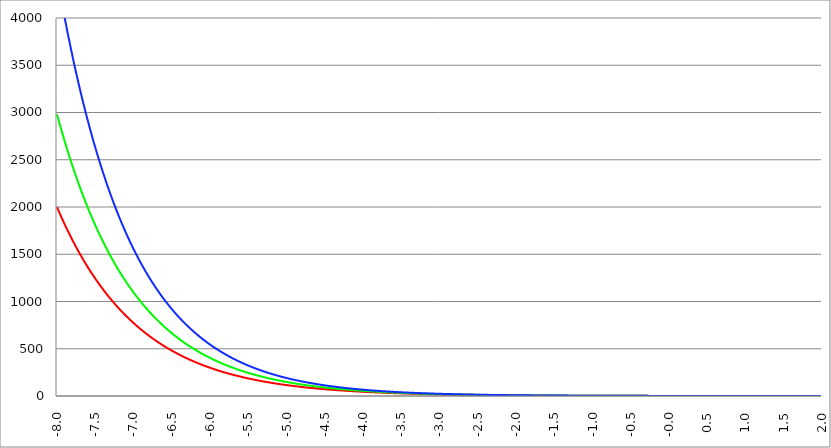
| Category | Series 1 | Series 0 | Series 2 |
|---|---|---|---|
| -8.0 | 1998.196 | 2980.958 | 4447.067 |
| -7.995 | 1988.727 | 2966.09 | 4423.781 |
| -7.99 | 1979.303 | 2951.297 | 4400.617 |
| -7.985 | 1969.924 | 2936.577 | 4377.574 |
| -7.98 | 1960.589 | 2921.931 | 4354.652 |
| -7.975 | 1951.298 | 2907.358 | 4331.85 |
| -7.97 | 1942.051 | 2892.857 | 4309.167 |
| -7.965000000000001 | 1932.848 | 2878.429 | 4286.604 |
| -7.960000000000001 | 1923.689 | 2864.073 | 4264.158 |
| -7.955000000000001 | 1914.573 | 2849.788 | 4241.83 |
| -7.950000000000001 | 1905.501 | 2835.575 | 4219.618 |
| -7.945000000000001 | 1896.471 | 2821.432 | 4197.524 |
| -7.940000000000001 | 1887.484 | 2807.361 | 4175.544 |
| -7.935000000000001 | 1878.54 | 2793.359 | 4153.68 |
| -7.930000000000001 | 1869.638 | 2779.427 | 4131.93 |
| -7.925000000000002 | 1860.778 | 2765.564 | 4110.295 |
| -7.920000000000002 | 1851.96 | 2751.771 | 4088.772 |
| -7.915000000000002 | 1843.184 | 2738.047 | 4067.362 |
| -7.910000000000002 | 1834.45 | 2724.39 | 4046.065 |
| -7.905000000000002 | 1825.757 | 2710.803 | 4024.878 |
| -7.900000000000002 | 1817.105 | 2697.282 | 4003.803 |
| -7.895000000000002 | 1808.494 | 2683.83 | 3982.838 |
| -7.890000000000002 | 1799.925 | 2670.444 | 3961.983 |
| -7.885000000000002 | 1791.395 | 2657.125 | 3941.237 |
| -7.880000000000002 | 1782.906 | 2643.873 | 3920.6 |
| -7.875000000000003 | 1774.457 | 2630.686 | 3900.071 |
| -7.870000000000003 | 1766.049 | 2617.566 | 3879.649 |
| -7.865000000000003 | 1757.68 | 2604.51 | 3859.334 |
| -7.860000000000003 | 1749.351 | 2591.52 | 3839.126 |
| -7.855000000000003 | 1741.061 | 2578.595 | 3819.023 |
| -7.850000000000003 | 1732.811 | 2565.734 | 3799.026 |
| -7.845000000000003 | 1724.599 | 2552.938 | 3779.133 |
| -7.840000000000003 | 1716.427 | 2540.205 | 3759.345 |
| -7.835000000000003 | 1708.293 | 2527.536 | 3739.66 |
| -7.830000000000004 | 1700.198 | 2514.929 | 3720.078 |
| -7.825000000000004 | 1692.141 | 2502.386 | 3700.599 |
| -7.820000000000004 | 1684.123 | 2489.905 | 3681.222 |
| -7.815000000000004 | 1676.142 | 2477.487 | 3661.946 |
| -7.810000000000004 | 1668.199 | 2465.13 | 3642.771 |
| -7.805000000000004 | 1660.294 | 2452.836 | 3623.697 |
| -7.800000000000004 | 1652.426 | 2440.602 | 3604.722 |
| -7.795000000000004 | 1644.596 | 2428.429 | 3585.847 |
| -7.790000000000004 | 1636.803 | 2416.318 | 3567.071 |
| -7.785000000000004 | 1629.046 | 2404.266 | 3548.393 |
| -7.780000000000004 | 1621.327 | 2392.275 | 3529.812 |
| -7.775000000000004 | 1613.644 | 2380.343 | 3511.329 |
| -7.770000000000004 | 1605.997 | 2368.471 | 3492.943 |
| -7.765000000000005 | 1598.387 | 2356.658 | 3474.653 |
| -7.760000000000005 | 1590.812 | 2344.905 | 3456.459 |
| -7.755000000000005 | 1583.274 | 2333.209 | 3438.36 |
| -7.750000000000005 | 1575.771 | 2321.572 | 3420.356 |
| -7.745000000000005 | 1568.304 | 2309.994 | 3402.446 |
| -7.740000000000005 | 1560.872 | 2298.472 | 3384.63 |
| -7.735000000000005 | 1553.476 | 2287.009 | 3366.908 |
| -7.730000000000005 | 1546.114 | 2275.602 | 3349.278 |
| -7.725000000000006 | 1538.787 | 2264.253 | 3331.74 |
| -7.720000000000006 | 1531.496 | 2252.96 | 3314.294 |
| -7.715000000000006 | 1524.238 | 2241.723 | 3296.94 |
| -7.710000000000006 | 1517.015 | 2230.542 | 3279.676 |
| -7.705000000000006 | 1509.826 | 2219.417 | 3262.503 |
| -7.700000000000006 | 1502.672 | 2208.348 | 3245.42 |
| -7.695000000000006 | 1495.551 | 2197.334 | 3228.426 |
| -7.690000000000006 | 1488.464 | 2186.375 | 3211.521 |
| -7.685000000000007 | 1481.411 | 2175.47 | 3194.705 |
| -7.680000000000007 | 1474.391 | 2164.62 | 3177.977 |
| -7.675000000000007 | 1467.404 | 2153.824 | 3161.336 |
| -7.670000000000007 | 1460.45 | 2143.081 | 3144.782 |
| -7.665000000000007 | 1453.529 | 2132.393 | 3128.316 |
| -7.660000000000007 | 1446.642 | 2121.757 | 3111.935 |
| -7.655000000000007 | 1439.786 | 2111.175 | 3095.64 |
| -7.650000000000007 | 1432.964 | 2100.646 | 3079.431 |
| -7.645000000000007 | 1426.173 | 2090.169 | 3063.306 |
| -7.640000000000008 | 1419.415 | 2079.744 | 3047.266 |
| -7.635000000000008 | 1412.689 | 2069.371 | 3031.31 |
| -7.630000000000008 | 1405.994 | 2059.05 | 3015.437 |
| -7.625000000000008 | 1399.332 | 2048.78 | 2999.647 |
| -7.620000000000008 | 1392.701 | 2038.562 | 2983.94 |
| -7.615000000000008 | 1386.101 | 2028.395 | 2968.316 |
| -7.610000000000008 | 1379.533 | 2018.278 | 2952.773 |
| -7.605000000000008 | 1372.995 | 2008.212 | 2937.312 |
| -7.600000000000008 | 1366.489 | 1998.196 | 2921.931 |
| -7.595000000000009 | 1360.014 | 1988.23 | 2906.631 |
| -7.590000000000009 | 1353.569 | 1978.314 | 2891.411 |
| -7.585000000000009 | 1347.155 | 1968.447 | 2876.271 |
| -7.580000000000009 | 1340.771 | 1958.629 | 2861.21 |
| -7.57500000000001 | 1334.417 | 1948.86 | 2846.228 |
| -7.57000000000001 | 1328.094 | 1939.14 | 2831.325 |
| -7.565000000000009 | 1321.8 | 1929.469 | 2816.499 |
| -7.560000000000009 | 1315.537 | 1919.846 | 2801.751 |
| -7.555000000000009 | 1309.303 | 1910.27 | 2787.081 |
| -7.55000000000001 | 1303.098 | 1900.743 | 2772.487 |
| -7.54500000000001 | 1296.923 | 1891.263 | 2757.97 |
| -7.54000000000001 | 1290.777 | 1881.83 | 2743.528 |
| -7.53500000000001 | 1284.661 | 1872.444 | 2729.162 |
| -7.53000000000001 | 1278.573 | 1863.106 | 2714.872 |
| -7.52500000000001 | 1272.514 | 1853.813 | 2700.656 |
| -7.52000000000001 | 1266.484 | 1844.567 | 2686.515 |
| -7.51500000000001 | 1260.483 | 1835.367 | 2672.448 |
| -7.51000000000001 | 1254.51 | 1826.214 | 2658.454 |
| -7.505000000000011 | 1248.565 | 1817.105 | 2644.534 |
| -7.500000000000011 | 1242.648 | 1808.042 | 2630.686 |
| -7.495000000000011 | 1236.76 | 1799.025 | 2616.911 |
| -7.490000000000011 | 1230.899 | 1790.052 | 2603.208 |
| -7.485000000000011 | 1225.066 | 1781.124 | 2589.577 |
| -7.480000000000011 | 1219.261 | 1772.241 | 2576.018 |
| -7.475000000000011 | 1213.483 | 1763.402 | 2562.529 |
| -7.470000000000011 | 1207.733 | 1754.607 | 2549.111 |
| -7.465000000000011 | 1202.009 | 1745.856 | 2535.763 |
| -7.460000000000011 | 1196.313 | 1737.148 | 2522.485 |
| -7.455000000000012 | 1190.644 | 1728.484 | 2509.277 |
| -7.450000000000012 | 1185.002 | 1719.863 | 2496.138 |
| -7.445000000000012 | 1179.387 | 1711.285 | 2483.068 |
| -7.440000000000012 | 1173.798 | 1702.75 | 2470.066 |
| -7.435000000000012 | 1168.236 | 1694.258 | 2457.132 |
| -7.430000000000012 | 1162.7 | 1685.808 | 2444.266 |
| -7.425000000000012 | 1157.19 | 1677.4 | 2431.467 |
| -7.420000000000012 | 1151.706 | 1669.034 | 2418.735 |
| -7.415000000000012 | 1146.249 | 1660.709 | 2406.07 |
| -7.410000000000013 | 1140.817 | 1652.426 | 2393.471 |
| -7.405000000000013 | 1135.411 | 1644.185 | 2380.938 |
| -7.400000000000013 | 1130.031 | 1635.984 | 2368.471 |
| -7.395000000000013 | 1124.676 | 1627.825 | 2356.069 |
| -7.390000000000013 | 1119.346 | 1619.706 | 2343.732 |
| -7.385000000000013 | 1114.042 | 1611.628 | 2331.46 |
| -7.380000000000013 | 1108.763 | 1603.59 | 2319.252 |
| -7.375000000000013 | 1103.509 | 1595.592 | 2307.108 |
| -7.370000000000013 | 1098.279 | 1587.634 | 2295.027 |
| -7.365000000000013 | 1093.075 | 1579.715 | 2283.01 |
| -7.360000000000014 | 1087.895 | 1571.837 | 2271.056 |
| -7.355000000000014 | 1082.74 | 1563.997 | 2259.164 |
| -7.350000000000014 | 1077.609 | 1556.197 | 2247.334 |
| -7.345000000000014 | 1072.503 | 1548.435 | 2235.567 |
| -7.340000000000014 | 1067.42 | 1540.712 | 2223.861 |
| -7.335000000000014 | 1062.362 | 1533.028 | 2212.216 |
| -7.330000000000014 | 1057.328 | 1525.382 | 2200.632 |
| -7.325000000000014 | 1052.317 | 1517.774 | 2189.109 |
| -7.320000000000014 | 1047.331 | 1510.204 | 2177.647 |
| -7.315000000000015 | 1042.368 | 1502.672 | 2166.244 |
| -7.310000000000015 | 1037.428 | 1495.177 | 2154.901 |
| -7.305000000000015 | 1032.512 | 1487.72 | 2143.617 |
| -7.300000000000015 | 1027.619 | 1480.3 | 2132.393 |
| -7.295000000000015 | 1022.75 | 1472.917 | 2121.227 |
| -7.290000000000015 | 1017.903 | 1465.571 | 2110.12 |
| -7.285000000000015 | 1013.08 | 1458.261 | 2099.071 |
| -7.280000000000015 | 1008.279 | 1450.988 | 2088.079 |
| -7.275000000000015 | 1003.501 | 1443.751 | 2077.146 |
| -7.270000000000015 | 998.746 | 1436.55 | 2066.269 |
| -7.265000000000016 | 994.013 | 1429.386 | 2055.45 |
| -7.260000000000016 | 989.302 | 1422.257 | 2044.687 |
| -7.255000000000016 | 984.614 | 1415.163 | 2033.981 |
| -7.250000000000016 | 979.948 | 1408.105 | 2023.33 |
| -7.245000000000016 | 975.305 | 1401.082 | 2012.735 |
| -7.240000000000016 | 970.683 | 1394.094 | 2002.196 |
| -7.235000000000016 | 966.083 | 1387.141 | 1991.712 |
| -7.230000000000016 | 961.505 | 1380.223 | 1981.283 |
| -7.225000000000017 | 956.949 | 1373.339 | 1970.909 |
| -7.220000000000017 | 952.414 | 1366.489 | 1960.589 |
| -7.215000000000017 | 947.901 | 1359.674 | 1950.322 |
| -7.210000000000017 | 943.409 | 1352.892 | 1940.11 |
| -7.205000000000017 | 938.939 | 1346.145 | 1929.951 |
| -7.200000000000017 | 934.489 | 1339.431 | 1919.846 |
| -7.195000000000017 | 930.061 | 1332.75 | 1909.793 |
| -7.190000000000017 | 925.654 | 1326.103 | 1899.793 |
| -7.185000000000017 | 921.267 | 1319.489 | 1889.845 |
| -7.180000000000017 | 916.901 | 1312.908 | 1879.949 |
| -7.175000000000018 | 912.556 | 1306.36 | 1870.105 |
| -7.170000000000018 | 908.232 | 1299.845 | 1860.313 |
| -7.165000000000018 | 903.928 | 1293.362 | 1850.572 |
| -7.160000000000018 | 899.645 | 1286.911 | 1840.882 |
| -7.155000000000018 | 895.382 | 1280.492 | 1831.243 |
| -7.150000000000018 | 891.139 | 1274.106 | 1821.654 |
| -7.145000000000018 | 886.916 | 1267.751 | 1812.115 |
| -7.140000000000018 | 882.713 | 1261.428 | 1802.626 |
| -7.135000000000018 | 878.53 | 1255.137 | 1793.187 |
| -7.130000000000019 | 874.367 | 1248.877 | 1783.798 |
| -7.125000000000019 | 870.223 | 1242.648 | 1774.457 |
| -7.120000000000019 | 866.1 | 1236.45 | 1765.166 |
| -7.115000000000019 | 861.995 | 1230.284 | 1755.923 |
| -7.110000000000019 | 857.911 | 1224.148 | 1746.729 |
| -7.105000000000019 | 853.845 | 1218.042 | 1737.582 |
| -7.100000000000019 | 849.799 | 1211.967 | 1728.484 |
| -7.095000000000019 | 845.772 | 1205.922 | 1719.433 |
| -7.090000000000019 | 841.764 | 1199.908 | 1710.43 |
| -7.085000000000019 | 837.775 | 1193.923 | 1701.474 |
| -7.08000000000002 | 833.805 | 1187.969 | 1692.564 |
| -7.07500000000002 | 829.854 | 1182.044 | 1683.702 |
| -7.07000000000002 | 825.922 | 1176.148 | 1674.885 |
| -7.06500000000002 | 822.008 | 1170.282 | 1666.115 |
| -7.06000000000002 | 818.113 | 1164.445 | 1657.391 |
| -7.05500000000002 | 814.236 | 1158.637 | 1648.713 |
| -7.05000000000002 | 810.377 | 1152.859 | 1640.08 |
| -7.04500000000002 | 806.537 | 1147.109 | 1631.492 |
| -7.04000000000002 | 802.715 | 1141.388 | 1622.949 |
| -7.03500000000002 | 798.911 | 1135.695 | 1614.451 |
| -7.03000000000002 | 795.126 | 1130.031 | 1605.997 |
| -7.025000000000021 | 791.358 | 1124.395 | 1597.588 |
| -7.020000000000021 | 787.608 | 1118.787 | 1589.222 |
| -7.015000000000021 | 783.875 | 1113.207 | 1580.901 |
| -7.010000000000021 | 780.161 | 1107.655 | 1572.623 |
| -7.005000000000021 | 776.464 | 1102.13 | 1564.388 |
| -7.000000000000021 | 772.784 | 1096.633 | 1556.197 |
| -6.995000000000021 | 769.122 | 1091.164 | 1548.048 |
| -6.990000000000021 | 765.478 | 1085.721 | 1539.942 |
| -6.985000000000021 | 761.85 | 1080.306 | 1531.878 |
| -6.980000000000021 | 758.24 | 1074.918 | 1523.857 |
| -6.975000000000021 | 754.647 | 1069.557 | 1515.878 |
| -6.970000000000021 | 751.071 | 1064.223 | 1507.94 |
| -6.965000000000022 | 747.512 | 1058.915 | 1500.044 |
| -6.960000000000022 | 743.969 | 1053.634 | 1492.19 |
| -6.955000000000022 | 740.444 | 1048.379 | 1484.376 |
| -6.950000000000022 | 736.935 | 1043.15 | 1476.604 |
| -6.945000000000022 | 733.443 | 1037.947 | 1468.872 |
| -6.940000000000022 | 729.967 | 1032.77 | 1461.181 |
| -6.935000000000022 | 726.508 | 1027.619 | 1453.529 |
| -6.930000000000022 | 723.066 | 1022.494 | 1445.918 |
| -6.925000000000023 | 719.639 | 1017.394 | 1438.347 |
| -6.920000000000023 | 716.229 | 1012.32 | 1430.816 |
| -6.915000000000023 | 712.835 | 1007.271 | 1423.324 |
| -6.910000000000023 | 709.457 | 1002.247 | 1415.871 |
| -6.905000000000023 | 706.095 | 997.249 | 1408.457 |
| -6.900000000000023 | 702.749 | 992.275 | 1401.082 |
| -6.895000000000023 | 699.419 | 987.326 | 1393.745 |
| -6.890000000000024 | 696.105 | 982.401 | 1386.448 |
| -6.885000000000024 | 692.806 | 977.502 | 1379.188 |
| -6.880000000000024 | 689.523 | 972.626 | 1371.966 |
| -6.875000000000024 | 686.255 | 967.775 | 1364.782 |
| -6.870000000000024 | 683.004 | 962.949 | 1357.636 |
| -6.865000000000024 | 679.767 | 958.146 | 1350.527 |
| -6.860000000000024 | 676.546 | 953.367 | 1343.455 |
| -6.855000000000024 | 673.34 | 948.612 | 1336.42 |
| -6.850000000000024 | 670.149 | 943.881 | 1329.423 |
| -6.845000000000024 | 666.973 | 939.173 | 1322.461 |
| -6.840000000000024 | 663.813 | 934.489 | 1315.537 |
| -6.835000000000024 | 660.667 | 929.828 | 1308.648 |
| -6.830000000000024 | 657.536 | 925.191 | 1301.796 |
| -6.825000000000025 | 654.42 | 920.576 | 1294.979 |
| -6.820000000000025 | 651.319 | 915.985 | 1288.198 |
| -6.815000000000025 | 648.233 | 911.417 | 1281.453 |
| -6.810000000000025 | 645.161 | 906.871 | 1274.743 |
| -6.805000000000025 | 642.104 | 902.348 | 1268.068 |
| -6.800000000000025 | 639.061 | 897.847 | 1261.428 |
| -6.795000000000025 | 636.033 | 893.369 | 1254.823 |
| -6.790000000000025 | 633.019 | 888.914 | 1248.253 |
| -6.785000000000025 | 630.019 | 884.48 | 1241.717 |
| -6.780000000000025 | 627.034 | 880.069 | 1235.215 |
| -6.775000000000026 | 624.062 | 875.679 | 1228.747 |
| -6.770000000000026 | 621.105 | 871.312 | 1222.313 |
| -6.765000000000026 | 618.162 | 866.966 | 1215.912 |
| -6.760000000000026 | 615.232 | 862.642 | 1209.546 |
| -6.755000000000026 | 612.317 | 858.34 | 1203.212 |
| -6.750000000000026 | 609.415 | 854.059 | 1196.912 |
| -6.745000000000026 | 606.527 | 849.799 | 1190.644 |
| -6.740000000000026 | 603.653 | 845.561 | 1184.41 |
| -6.735000000000026 | 600.793 | 841.343 | 1178.208 |
| -6.730000000000026 | 597.946 | 837.147 | 1172.039 |
| -6.725000000000027 | 595.112 | 832.972 | 1165.902 |
| -6.720000000000027 | 592.292 | 828.818 | 1159.797 |
| -6.715000000000027 | 589.485 | 824.684 | 1153.724 |
| -6.710000000000027 | 586.692 | 820.571 | 1147.683 |
| -6.705000000000027 | 583.912 | 816.478 | 1141.673 |
| -6.700000000000027 | 581.145 | 812.406 | 1135.695 |
| -6.695000000000028 | 578.391 | 808.354 | 1129.748 |
| -6.690000000000028 | 575.65 | 804.322 | 1123.833 |
| -6.685000000000028 | 572.922 | 800.311 | 1117.948 |
| -6.680000000000028 | 570.207 | 796.319 | 1112.094 |
| -6.675000000000028 | 567.505 | 792.347 | 1106.271 |
| -6.670000000000028 | 564.816 | 788.396 | 1100.478 |
| -6.665000000000028 | 562.139 | 784.463 | 1094.716 |
| -6.660000000000028 | 559.476 | 780.551 | 1088.984 |
| -6.655000000000029 | 556.824 | 776.658 | 1083.281 |
| -6.650000000000029 | 554.186 | 772.784 | 1077.609 |
| -6.645000000000029 | 551.56 | 768.93 | 1071.966 |
| -6.640000000000029 | 548.946 | 765.095 | 1066.353 |
| -6.63500000000003 | 546.345 | 761.279 | 1060.77 |
| -6.63000000000003 | 543.756 | 757.482 | 1055.215 |
| -6.625000000000029 | 541.179 | 753.704 | 1049.69 |
| -6.620000000000029 | 538.614 | 749.945 | 1044.193 |
| -6.615000000000029 | 536.062 | 746.205 | 1038.726 |
| -6.61000000000003 | 533.522 | 742.483 | 1033.287 |
| -6.60500000000003 | 530.994 | 738.78 | 1027.876 |
| -6.60000000000003 | 528.477 | 735.095 | 1022.494 |
| -6.59500000000003 | 525.973 | 731.429 | 1017.14 |
| -6.59000000000003 | 523.481 | 727.781 | 1011.814 |
| -6.58500000000003 | 521 | 724.151 | 1006.516 |
| -6.58000000000003 | 518.531 | 720.539 | 1001.245 |
| -6.57500000000003 | 516.074 | 716.946 | 996.003 |
| -6.57000000000003 | 513.628 | 713.37 | 990.787 |
| -6.565000000000031 | 511.194 | 709.812 | 985.599 |
| -6.560000000000031 | 508.772 | 706.272 | 980.439 |
| -6.555000000000031 | 506.361 | 702.749 | 975.305 |
| -6.550000000000031 | 503.962 | 699.244 | 970.198 |
| -6.545000000000031 | 501.573 | 695.757 | 965.118 |
| -6.540000000000031 | 499.197 | 692.287 | 960.064 |
| -6.535000000000031 | 496.831 | 688.834 | 955.037 |
| -6.530000000000031 | 494.477 | 685.398 | 950.036 |
| -6.525000000000031 | 492.133 | 681.98 | 945.061 |
| -6.520000000000032 | 489.801 | 678.578 | 940.113 |
| -6.515000000000032 | 487.48 | 675.194 | 935.19 |
| -6.510000000000032 | 485.17 | 671.826 | 930.293 |
| -6.505000000000032 | 482.871 | 668.476 | 925.422 |
| -6.500000000000032 | 480.583 | 665.142 | 920.576 |
| -6.495000000000032 | 478.306 | 661.824 | 915.756 |
| -6.490000000000032 | 476.039 | 658.523 | 910.961 |
| -6.485000000000032 | 473.783 | 655.239 | 906.191 |
| -6.480000000000032 | 471.538 | 651.971 | 901.446 |
| -6.475000000000032 | 469.304 | 648.719 | 896.726 |
| -6.470000000000032 | 467.08 | 645.484 | 892.03 |
| -6.465000000000033 | 464.866 | 642.264 | 887.359 |
| -6.460000000000033 | 462.663 | 639.061 | 882.713 |
| -6.455000000000033 | 460.471 | 635.874 | 878.091 |
| -6.450000000000033 | 458.289 | 632.702 | 873.493 |
| -6.445000000000033 | 456.117 | 629.547 | 868.919 |
| -6.440000000000033 | 453.956 | 626.407 | 864.369 |
| -6.435000000000033 | 451.805 | 623.283 | 859.843 |
| -6.430000000000033 | 449.664 | 620.174 | 855.341 |
| -6.425000000000034 | 447.533 | 617.081 | 850.862 |
| -6.420000000000034 | 445.412 | 614.003 | 846.407 |
| -6.415000000000034 | 443.301 | 610.941 | 841.975 |
| -6.410000000000034 | 441.201 | 607.894 | 837.566 |
| -6.405000000000034 | 439.11 | 604.862 | 833.18 |
| -6.400000000000034 | 437.029 | 601.845 | 828.818 |
| -6.395000000000034 | 434.958 | 598.843 | 824.478 |
| -6.390000000000034 | 432.897 | 595.857 | 820.16 |
| -6.385000000000034 | 430.846 | 592.885 | 815.866 |
| -6.380000000000034 | 428.804 | 589.928 | 811.594 |
| -6.375000000000034 | 426.772 | 586.985 | 807.344 |
| -6.370000000000034 | 424.75 | 584.058 | 803.117 |
| -6.365000000000035 | 422.737 | 581.145 | 798.911 |
| -6.360000000000035 | 420.734 | 578.246 | 794.728 |
| -6.355000000000035 | 418.74 | 575.362 | 790.567 |
| -6.350000000000035 | 416.756 | 572.493 | 786.427 |
| -6.345000000000035 | 414.781 | 569.637 | 782.309 |
| -6.340000000000035 | 412.815 | 566.796 | 778.213 |
| -6.335000000000035 | 410.859 | 563.969 | 774.138 |
| -6.330000000000035 | 408.912 | 561.157 | 770.084 |
| -6.325000000000036 | 406.974 | 558.358 | 766.052 |
| -6.320000000000036 | 405.046 | 555.573 | 762.041 |
| -6.315000000000036 | 403.126 | 552.802 | 758.05 |
| -6.310000000000036 | 401.216 | 550.045 | 754.081 |
| -6.305000000000036 | 399.315 | 547.302 | 750.133 |
| -6.300000000000036 | 397.423 | 544.572 | 746.205 |
| -6.295000000000036 | 395.539 | 541.856 | 742.297 |
| -6.290000000000036 | 393.665 | 539.153 | 738.411 |
| -6.285000000000036 | 391.799 | 536.464 | 734.544 |
| -6.280000000000036 | 389.943 | 533.789 | 730.698 |
| -6.275000000000036 | 388.095 | 531.126 | 726.872 |
| -6.270000000000036 | 386.256 | 528.477 | 723.066 |
| -6.265000000000037 | 384.425 | 525.842 | 719.279 |
| -6.260000000000037 | 382.604 | 523.219 | 715.513 |
| -6.255000000000037 | 380.791 | 520.609 | 711.767 |
| -6.250000000000037 | 378.986 | 518.013 | 708.04 |
| -6.245000000000037 | 377.19 | 515.429 | 704.332 |
| -6.240000000000037 | 375.403 | 512.859 | 700.644 |
| -6.235000000000037 | 373.624 | 510.301 | 696.975 |
| -6.230000000000037 | 371.854 | 507.755 | 693.326 |
| -6.225000000000038 | 370.091 | 505.223 | 689.695 |
| -6.220000000000038 | 368.338 | 502.703 | 686.084 |
| -6.215000000000038 | 366.592 | 500.196 | 682.491 |
| -6.210000000000038 | 364.855 | 497.701 | 678.918 |
| -6.205000000000038 | 363.126 | 495.219 | 675.363 |
| -6.200000000000038 | 361.405 | 492.749 | 671.826 |
| -6.195000000000038 | 359.693 | 490.291 | 668.309 |
| -6.190000000000039 | 357.988 | 487.846 | 664.809 |
| -6.185000000000039 | 356.292 | 485.413 | 661.328 |
| -6.180000000000039 | 354.603 | 482.992 | 657.865 |
| -6.175000000000039 | 352.923 | 480.583 | 654.42 |
| -6.170000000000039 | 351.251 | 478.186 | 650.994 |
| -6.165000000000039 | 349.586 | 475.801 | 647.585 |
| -6.160000000000039 | 347.93 | 473.428 | 644.194 |
| -6.155000000000039 | 346.281 | 471.067 | 640.821 |
| -6.150000000000039 | 344.64 | 468.717 | 637.465 |
| -6.14500000000004 | 343.007 | 466.38 | 634.127 |
| -6.14000000000004 | 341.381 | 464.054 | 630.807 |
| -6.13500000000004 | 339.764 | 461.739 | 627.504 |
| -6.13000000000004 | 338.154 | 459.436 | 624.218 |
| -6.12500000000004 | 336.551 | 457.145 | 620.95 |
| -6.12000000000004 | 334.956 | 454.865 | 617.698 |
| -6.11500000000004 | 333.369 | 452.596 | 614.464 |
| -6.11000000000004 | 331.789 | 450.339 | 611.246 |
| -6.10500000000004 | 330.217 | 448.093 | 608.046 |
| -6.10000000000004 | 328.652 | 445.858 | 604.862 |
| -6.095000000000041 | 327.095 | 443.634 | 601.695 |
| -6.090000000000041 | 325.545 | 441.421 | 598.544 |
| -6.085000000000041 | 324.002 | 439.22 | 595.41 |
| -6.080000000000041 | 322.467 | 437.029 | 592.292 |
| -6.075000000000041 | 320.939 | 434.85 | 589.191 |
| -6.070000000000041 | 319.418 | 432.681 | 586.106 |
| -6.065000000000041 | 317.904 | 430.523 | 583.037 |
| -6.060000000000041 | 316.398 | 428.375 | 579.984 |
| -6.055000000000041 | 314.898 | 426.239 | 576.947 |
| -6.050000000000042 | 313.406 | 424.113 | 573.926 |
| -6.045000000000042 | 311.921 | 421.998 | 570.921 |
| -6.040000000000042 | 310.443 | 419.893 | 567.931 |
| -6.035000000000042 | 308.972 | 417.799 | 564.957 |
| -6.030000000000042 | 307.508 | 415.715 | 561.999 |
| -6.025000000000042 | 306.05 | 413.642 | 559.056 |
| -6.020000000000042 | 304.6 | 411.579 | 556.129 |
| -6.015000000000042 | 303.157 | 409.526 | 553.217 |
| -6.010000000000042 | 301.72 | 407.483 | 550.32 |
| -6.005000000000043 | 300.29 | 405.451 | 547.438 |
| -6.000000000000043 | 298.867 | 403.429 | 544.572 |
| -5.995000000000043 | 297.451 | 401.417 | 541.72 |
| -5.990000000000043 | 296.042 | 399.415 | 538.884 |
| -5.985000000000043 | 294.639 | 397.423 | 536.062 |
| -5.980000000000043 | 293.243 | 395.44 | 533.255 |
| -5.975000000000043 | 291.853 | 393.468 | 530.463 |
| -5.970000000000043 | 290.47 | 391.506 | 527.685 |
| -5.965000000000043 | 289.093 | 389.553 | 524.922 |
| -5.960000000000043 | 287.724 | 387.61 | 522.174 |
| -5.955000000000044 | 286.36 | 385.677 | 519.439 |
| -5.950000000000044 | 285.003 | 383.753 | 516.719 |
| -5.945000000000044 | 283.653 | 381.839 | 514.014 |
| -5.940000000000044 | 282.308 | 379.935 | 511.322 |
| -5.935000000000044 | 280.971 | 378.04 | 508.645 |
| -5.930000000000044 | 279.639 | 376.155 | 505.981 |
| -5.925000000000044 | 278.314 | 374.278 | 503.332 |
| -5.920000000000044 | 276.995 | 372.412 | 500.696 |
| -5.915000000000044 | 275.683 | 370.554 | 498.075 |
| -5.910000000000044 | 274.376 | 368.706 | 495.467 |
| -5.905000000000044 | 273.076 | 366.867 | 492.872 |
| -5.900000000000044 | 271.782 | 365.037 | 490.291 |
| -5.895000000000045 | 270.494 | 363.217 | 487.724 |
| -5.890000000000045 | 269.212 | 361.405 | 485.17 |
| -5.885000000000045 | 267.936 | 359.603 | 482.63 |
| -5.880000000000045 | 266.667 | 357.809 | 480.103 |
| -5.875000000000045 | 265.403 | 356.025 | 477.589 |
| -5.870000000000045 | 264.145 | 354.249 | 475.088 |
| -5.865000000000045 | 262.894 | 352.482 | 472.6 |
| -5.860000000000046 | 261.648 | 350.724 | 470.126 |
| -5.855000000000046 | 260.408 | 348.975 | 467.664 |
| -5.850000000000046 | 259.174 | 347.234 | 465.215 |
| -5.845000000000046 | 257.946 | 345.503 | 462.779 |
| -5.840000000000046 | 256.724 | 343.779 | 460.356 |
| -5.835000000000046 | 255.507 | 342.065 | 457.945 |
| -5.830000000000046 | 254.296 | 340.359 | 455.548 |
| -5.825000000000046 | 253.091 | 338.661 | 453.162 |
| -5.820000000000046 | 251.892 | 336.972 | 450.789 |
| -5.815000000000047 | 250.698 | 335.291 | 448.429 |
| -5.810000000000047 | 249.51 | 333.619 | 446.081 |
| -5.805000000000047 | 248.328 | 331.955 | 443.745 |
| -5.800000000000047 | 247.151 | 330.3 | 441.421 |
| -5.795000000000047 | 245.98 | 328.652 | 439.11 |
| -5.790000000000047 | 244.814 | 327.013 | 436.811 |
| -5.785000000000047 | 243.654 | 325.382 | 434.523 |
| -5.780000000000047 | 242.5 | 323.759 | 432.248 |
| -5.775000000000047 | 241.35 | 322.144 | 429.985 |
| -5.770000000000047 | 240.207 | 320.538 | 427.733 |
| -5.765000000000048 | 239.068 | 318.939 | 425.494 |
| -5.760000000000048 | 237.936 | 317.348 | 423.266 |
| -5.755000000000048 | 236.808 | 315.766 | 421.049 |
| -5.750000000000048 | 235.686 | 314.191 | 418.845 |
| -5.745000000000048 | 234.569 | 312.624 | 416.651 |
| -5.740000000000048 | 233.457 | 311.064 | 414.47 |
| -5.735000000000048 | 232.351 | 309.513 | 412.299 |
| -5.730000000000048 | 231.25 | 307.969 | 410.141 |
| -5.725000000000048 | 230.154 | 306.433 | 407.993 |
| -5.720000000000049 | 229.064 | 304.905 | 405.857 |
| -5.715000000000049 | 227.978 | 303.384 | 403.731 |
| -5.710000000000049 | 226.898 | 301.871 | 401.617 |
| -5.705000000000049 | 225.823 | 300.365 | 399.514 |
| -5.700000000000049 | 224.753 | 298.867 | 397.423 |
| -5.695000000000049 | 223.688 | 297.377 | 395.342 |
| -5.690000000000049 | 222.628 | 295.894 | 393.271 |
| -5.685000000000049 | 221.573 | 294.418 | 391.212 |
| -5.680000000000049 | 220.523 | 292.949 | 389.164 |
| -5.675000000000049 | 219.478 | 291.488 | 387.126 |
| -5.67000000000005 | 218.438 | 290.035 | 385.099 |
| -5.66500000000005 | 217.402 | 288.588 | 383.082 |
| -5.66000000000005 | 216.372 | 287.149 | 381.076 |
| -5.65500000000005 | 215.347 | 285.716 | 379.081 |
| -5.65000000000005 | 214.326 | 284.291 | 377.096 |
| -5.64500000000005 | 213.311 | 282.874 | 375.122 |
| -5.64000000000005 | 212.3 | 281.463 | 373.157 |
| -5.63500000000005 | 211.294 | 280.059 | 371.203 |
| -5.63000000000005 | 210.293 | 278.662 | 369.26 |
| -5.625000000000051 | 209.296 | 277.272 | 367.326 |
| -5.620000000000051 | 208.304 | 275.889 | 365.403 |
| -5.615000000000051 | 207.317 | 274.513 | 363.489 |
| -5.610000000000051 | 206.335 | 273.144 | 361.586 |
| -5.605000000000051 | 205.357 | 271.782 | 359.693 |
| -5.600000000000051 | 204.384 | 270.426 | 357.809 |
| -5.595000000000051 | 203.415 | 269.078 | 355.936 |
| -5.590000000000051 | 202.451 | 267.736 | 354.072 |
| -5.585000000000051 | 201.492 | 266.4 | 352.218 |
| -5.580000000000052 | 200.537 | 265.072 | 350.374 |
| -5.575000000000052 | 199.587 | 263.75 | 348.539 |
| -5.570000000000052 | 198.641 | 262.434 | 346.714 |
| -5.565000000000052 | 197.7 | 261.125 | 344.898 |
| -5.560000000000052 | 196.763 | 259.823 | 343.092 |
| -5.555000000000052 | 195.831 | 258.527 | 341.296 |
| -5.550000000000052 | 194.903 | 257.238 | 339.509 |
| -5.545000000000052 | 193.979 | 255.955 | 337.731 |
| -5.540000000000052 | 193.06 | 254.678 | 335.963 |
| -5.535000000000053 | 192.145 | 253.408 | 334.203 |
| -5.530000000000053 | 191.234 | 252.144 | 332.453 |
| -5.525000000000053 | 190.328 | 250.886 | 330.713 |
| -5.520000000000053 | 189.426 | 249.635 | 328.981 |
| -5.515000000000053 | 188.529 | 248.39 | 327.258 |
| -5.510000000000053 | 187.635 | 247.151 | 325.545 |
| -5.505000000000053 | 186.746 | 245.918 | 323.84 |
| -5.500000000000053 | 185.861 | 244.692 | 322.144 |
| -5.495000000000053 | 184.98 | 243.472 | 320.458 |
| -5.490000000000053 | 184.104 | 242.257 | 318.78 |
| -5.485000000000054 | 183.231 | 241.049 | 317.11 |
| -5.480000000000054 | 182.363 | 239.847 | 315.45 |
| -5.475000000000054 | 181.499 | 238.65 | 313.798 |
| -5.470000000000054 | 180.639 | 237.46 | 312.155 |
| -5.465000000000054 | 179.783 | 236.276 | 310.521 |
| -5.460000000000054 | 178.931 | 235.097 | 308.895 |
| -5.455000000000054 | 178.083 | 233.925 | 307.277 |
| -5.450000000000054 | 177.239 | 232.758 | 305.668 |
| -5.445000000000054 | 176.399 | 231.597 | 304.068 |
| -5.440000000000054 | 175.563 | 230.442 | 302.475 |
| -5.435000000000054 | 174.731 | 229.293 | 300.892 |
| -5.430000000000054 | 173.903 | 228.149 | 299.316 |
| -5.425000000000055 | 173.079 | 227.011 | 297.749 |
| -5.420000000000055 | 172.259 | 225.879 | 296.19 |
| -5.415000000000055 | 171.443 | 224.753 | 294.639 |
| -5.410000000000055 | 170.63 | 223.632 | 293.096 |
| -5.405000000000055 | 169.822 | 222.516 | 291.561 |
| -5.400000000000055 | 169.017 | 221.406 | 290.035 |
| -5.395000000000055 | 168.216 | 220.302 | 288.516 |
| -5.390000000000056 | 167.419 | 219.203 | 287.005 |
| -5.385000000000056 | 166.626 | 218.11 | 285.502 |
| -5.380000000000056 | 165.836 | 217.022 | 284.007 |
| -5.375000000000056 | 165.05 | 215.94 | 282.52 |
| -5.370000000000056 | 164.268 | 214.863 | 281.041 |
| -5.365000000000056 | 163.49 | 213.791 | 279.569 |
| -5.360000000000056 | 162.715 | 212.725 | 278.105 |
| -5.355000000000056 | 161.944 | 211.664 | 276.649 |
| -5.350000000000056 | 161.176 | 210.608 | 275.201 |
| -5.345000000000057 | 160.413 | 209.558 | 273.76 |
| -5.340000000000057 | 159.653 | 208.513 | 272.326 |
| -5.335000000000057 | 158.896 | 207.473 | 270.9 |
| -5.330000000000057 | 158.143 | 206.438 | 269.482 |
| -5.325000000000057 | 157.394 | 205.408 | 268.07 |
| -5.320000000000057 | 156.648 | 204.384 | 266.667 |
| -5.315000000000057 | 155.905 | 203.365 | 265.27 |
| -5.310000000000057 | 155.167 | 202.35 | 263.881 |
| -5.305000000000057 | 154.431 | 201.341 | 262.5 |
| -5.300000000000058 | 153.7 | 200.337 | 261.125 |
| -5.295000000000058 | 152.971 | 199.338 | 259.758 |
| -5.290000000000058 | 152.246 | 198.343 | 258.398 |
| -5.285000000000058 | 151.525 | 197.354 | 257.045 |
| -5.280000000000058 | 150.807 | 196.37 | 255.699 |
| -5.275000000000058 | 150.092 | 195.39 | 254.36 |
| -5.270000000000058 | 149.381 | 194.416 | 253.028 |
| -5.265000000000058 | 148.673 | 193.446 | 251.703 |
| -5.260000000000058 | 147.969 | 192.481 | 250.385 |
| -5.255000000000058 | 147.267 | 191.521 | 249.074 |
| -5.250000000000059 | 146.57 | 190.566 | 247.77 |
| -5.245000000000059 | 145.875 | 189.616 | 246.472 |
| -5.240000000000059 | 145.184 | 188.67 | 245.182 |
| -5.235000000000059 | 144.496 | 187.729 | 243.898 |
| -5.23000000000006 | 143.811 | 186.793 | 242.621 |
| -5.225000000000059 | 143.13 | 185.861 | 241.35 |
| -5.220000000000059 | 142.451 | 184.934 | 240.087 |
| -5.215000000000059 | 141.776 | 184.012 | 238.83 |
| -5.210000000000059 | 141.104 | 183.094 | 237.579 |
| -5.20500000000006 | 140.436 | 182.181 | 236.335 |
| -5.20000000000006 | 139.77 | 181.272 | 235.097 |
| -5.19500000000006 | 139.108 | 180.368 | 233.866 |
| -5.19000000000006 | 138.449 | 179.469 | 232.642 |
| -5.18500000000006 | 137.793 | 178.573 | 231.424 |
| -5.18000000000006 | 137.14 | 177.683 | 230.212 |
| -5.17500000000006 | 136.49 | 176.797 | 229.006 |
| -5.17000000000006 | 135.843 | 175.915 | 227.807 |
| -5.16500000000006 | 135.199 | 175.037 | 226.614 |
| -5.160000000000061 | 134.559 | 174.164 | 225.428 |
| -5.155000000000061 | 133.921 | 173.296 | 224.247 |
| -5.150000000000061 | 133.286 | 172.431 | 223.073 |
| -5.145000000000061 | 132.655 | 171.571 | 221.905 |
| -5.140000000000061 | 132.026 | 170.716 | 220.743 |
| -5.135000000000061 | 131.401 | 169.864 | 219.587 |
| -5.130000000000061 | 130.778 | 169.017 | 218.438 |
| -5.125000000000061 | 130.158 | 168.174 | 217.294 |
| -5.120000000000061 | 129.541 | 167.335 | 216.156 |
| -5.115000000000061 | 128.927 | 166.501 | 215.024 |
| -5.110000000000062 | 128.317 | 165.67 | 213.898 |
| -5.105000000000062 | 127.708 | 164.844 | 212.778 |
| -5.100000000000062 | 127.103 | 164.022 | 211.664 |
| -5.095000000000062 | 126.501 | 163.204 | 210.556 |
| -5.090000000000062 | 125.902 | 162.39 | 209.453 |
| -5.085000000000062 | 125.305 | 161.58 | 208.356 |
| -5.080000000000062 | 124.711 | 160.774 | 207.265 |
| -5.075000000000062 | 124.12 | 159.972 | 206.18 |
| -5.070000000000062 | 123.532 | 159.174 | 205.1 |
| -5.065000000000063 | 122.947 | 158.38 | 204.027 |
| -5.060000000000063 | 122.364 | 157.591 | 202.958 |
| -5.055000000000063 | 121.784 | 156.805 | 201.895 |
| -5.050000000000063 | 121.207 | 156.022 | 200.838 |
| -5.045000000000063 | 120.633 | 155.244 | 199.787 |
| -5.040000000000063 | 120.061 | 154.47 | 198.741 |
| -5.035000000000063 | 119.492 | 153.7 | 197.7 |
| -5.030000000000063 | 118.926 | 152.933 | 196.665 |
| -5.025000000000063 | 118.362 | 152.17 | 195.635 |
| -5.020000000000064 | 117.801 | 151.411 | 194.61 |
| -5.015000000000064 | 117.243 | 150.656 | 193.591 |
| -5.010000000000064 | 116.688 | 149.905 | 192.578 |
| -5.005000000000064 | 116.135 | 149.157 | 191.569 |
| -5.000000000000064 | 115.584 | 148.413 | 190.566 |
| -4.995000000000064 | 115.037 | 147.673 | 189.568 |
| -4.990000000000064 | 114.491 | 146.936 | 188.576 |
| -4.985000000000064 | 113.949 | 146.204 | 187.588 |
| -4.980000000000064 | 113.409 | 145.474 | 186.606 |
| -4.975000000000064 | 112.871 | 144.749 | 185.629 |
| -4.970000000000064 | 112.337 | 144.027 | 184.657 |
| -4.965000000000064 | 111.804 | 143.309 | 183.69 |
| -4.960000000000064 | 111.274 | 142.594 | 182.728 |
| -4.955000000000064 | 110.747 | 141.883 | 181.771 |
| -4.950000000000064 | 110.222 | 141.175 | 180.82 |
| -4.945000000000065 | 109.7 | 140.471 | 179.873 |
| -4.940000000000065 | 109.18 | 139.77 | 178.931 |
| -4.935000000000065 | 108.663 | 139.073 | 177.994 |
| -4.930000000000065 | 108.148 | 138.38 | 177.062 |
| -4.925000000000065 | 107.635 | 137.689 | 176.135 |
| -4.920000000000065 | 107.125 | 137.003 | 175.213 |
| -4.915000000000065 | 106.618 | 136.319 | 174.295 |
| -4.910000000000065 | 106.113 | 135.639 | 173.382 |
| -4.905000000000065 | 105.61 | 134.963 | 172.475 |
| -4.900000000000066 | 105.109 | 134.29 | 171.571 |
| -4.895000000000066 | 104.611 | 133.62 | 170.673 |
| -4.890000000000066 | 104.115 | 132.954 | 169.779 |
| -4.885000000000066 | 103.622 | 132.29 | 168.89 |
| -4.880000000000066 | 103.131 | 131.631 | 168.006 |
| -4.875000000000066 | 102.642 | 130.974 | 167.126 |
| -4.870000000000066 | 102.156 | 130.321 | 166.251 |
| -4.865000000000067 | 101.672 | 129.671 | 165.381 |
| -4.860000000000067 | 101.19 | 129.024 | 164.515 |
| -4.855000000000067 | 100.71 | 128.381 | 163.653 |
| -4.850000000000067 | 100.233 | 127.74 | 162.796 |
| -4.845000000000067 | 99.758 | 127.103 | 161.944 |
| -4.840000000000067 | 99.286 | 126.469 | 161.096 |
| -4.835000000000067 | 98.815 | 125.839 | 160.252 |
| -4.830000000000067 | 98.347 | 125.211 | 159.413 |
| -4.825000000000068 | 97.881 | 124.586 | 158.579 |
| -4.820000000000068 | 97.417 | 123.965 | 157.748 |
| -4.815000000000068 | 96.955 | 123.347 | 156.922 |
| -4.810000000000068 | 96.496 | 122.732 | 156.1 |
| -4.805000000000068 | 96.039 | 122.119 | 155.283 |
| -4.800000000000068 | 95.583 | 121.51 | 154.47 |
| -4.795000000000068 | 95.131 | 120.904 | 153.661 |
| -4.790000000000068 | 94.68 | 120.301 | 152.857 |
| -4.785000000000068 | 94.231 | 119.701 | 152.056 |
| -4.780000000000068 | 93.785 | 119.104 | 151.26 |
| -4.775000000000068 | 93.34 | 118.51 | 150.468 |
| -4.770000000000068 | 92.898 | 117.919 | 149.68 |
| -4.765000000000069 | 92.458 | 117.331 | 148.896 |
| -4.760000000000069 | 92.019 | 116.746 | 148.117 |
| -4.75500000000007 | 91.583 | 116.164 | 147.341 |
| -4.75000000000007 | 91.149 | 115.584 | 146.57 |
| -4.74500000000007 | 90.717 | 115.008 | 145.802 |
| -4.74000000000007 | 90.288 | 114.434 | 145.039 |
| -4.73500000000007 | 89.86 | 113.863 | 144.279 |
| -4.73000000000007 | 89.434 | 113.296 | 143.524 |
| -4.72500000000007 | 89.01 | 112.73 | 142.772 |
| -4.72000000000007 | 88.588 | 112.168 | 142.025 |
| -4.71500000000007 | 88.169 | 111.609 | 141.281 |
| -4.71000000000007 | 87.751 | 111.052 | 140.541 |
| -4.70500000000007 | 87.335 | 110.498 | 139.805 |
| -4.70000000000007 | 86.921 | 109.947 | 139.073 |
| -4.69500000000007 | 86.509 | 109.399 | 138.345 |
| -4.69000000000007 | 86.099 | 108.853 | 137.621 |
| -4.685000000000071 | 85.691 | 108.31 | 136.9 |
| -4.680000000000071 | 85.285 | 107.77 | 136.183 |
| -4.675000000000071 | 84.881 | 107.233 | 135.47 |
| -4.670000000000071 | 84.479 | 106.698 | 134.761 |
| -4.665000000000071 | 84.078 | 106.166 | 134.055 |
| -4.660000000000071 | 83.68 | 105.636 | 133.353 |
| -4.655000000000071 | 83.283 | 105.109 | 132.655 |
| -4.650000000000071 | 82.889 | 104.585 | 131.96 |
| -4.645000000000071 | 82.496 | 104.063 | 131.269 |
| -4.640000000000072 | 82.105 | 103.544 | 130.582 |
| -4.635000000000072 | 81.716 | 103.028 | 129.898 |
| -4.630000000000072 | 81.329 | 102.514 | 129.218 |
| -4.625000000000072 | 80.943 | 102.003 | 128.541 |
| -4.620000000000072 | 80.56 | 101.494 | 127.868 |
| -4.615000000000072 | 80.178 | 100.988 | 127.199 |
| -4.610000000000072 | 79.798 | 100.484 | 126.533 |
| -4.605000000000072 | 79.42 | 99.983 | 125.87 |
| -4.600000000000072 | 79.044 | 99.484 | 125.211 |
| -4.595000000000073 | 78.669 | 98.988 | 124.555 |
| -4.590000000000073 | 78.296 | 98.494 | 123.903 |
| -4.585000000000073 | 77.925 | 98.003 | 123.254 |
| -4.580000000000073 | 77.556 | 97.514 | 122.609 |
| -4.575000000000073 | 77.188 | 97.028 | 121.967 |
| -4.570000000000073 | 76.823 | 96.544 | 121.328 |
| -4.565000000000073 | 76.459 | 96.063 | 120.693 |
| -4.560000000000073 | 76.096 | 95.583 | 120.061 |
| -4.555000000000073 | 75.736 | 95.107 | 119.432 |
| -4.550000000000074 | 75.377 | 94.632 | 118.807 |
| -4.545000000000074 | 75.02 | 94.16 | 118.185 |
| -4.540000000000074 | 74.664 | 93.691 | 117.566 |
| -4.535000000000074 | 74.31 | 93.224 | 116.95 |
| -4.530000000000074 | 73.958 | 92.759 | 116.338 |
| -4.525000000000074 | 73.608 | 92.296 | 115.729 |
| -4.520000000000074 | 73.259 | 91.836 | 115.123 |
| -4.515000000000074 | 72.912 | 91.378 | 114.52 |
| -4.510000000000074 | 72.566 | 90.922 | 113.92 |
| -4.505000000000074 | 72.222 | 90.468 | 113.324 |
| -4.500000000000074 | 71.88 | 90.017 | 112.73 |
| -4.495000000000074 | 71.54 | 89.568 | 112.14 |
| -4.490000000000074 | 71.201 | 89.121 | 111.553 |
| -4.485000000000074 | 70.863 | 88.677 | 110.969 |
| -4.480000000000074 | 70.527 | 88.235 | 110.388 |
| -4.475000000000075 | 70.193 | 87.795 | 109.81 |
| -4.470000000000075 | 69.86 | 87.357 | 109.235 |
| -4.465000000000075 | 69.529 | 86.921 | 108.663 |
| -4.460000000000075 | 69.2 | 86.488 | 108.094 |
| -4.455000000000075 | 68.872 | 86.056 | 107.528 |
| -4.450000000000075 | 68.546 | 85.627 | 106.965 |
| -4.445000000000075 | 68.221 | 85.2 | 106.405 |
| -4.440000000000075 | 67.898 | 84.775 | 105.848 |
| -4.435000000000075 | 67.576 | 84.352 | 105.293 |
| -4.430000000000076 | 67.256 | 83.931 | 104.742 |
| -4.425000000000076 | 66.937 | 83.513 | 104.194 |
| -4.420000000000076 | 66.62 | 83.096 | 103.648 |
| -4.415000000000076 | 66.304 | 82.682 | 103.105 |
| -4.410000000000076 | 65.99 | 82.269 | 102.565 |
| -4.405000000000076 | 65.677 | 81.859 | 102.028 |
| -4.400000000000076 | 65.366 | 81.451 | 101.494 |
| -4.395000000000077 | 65.056 | 81.045 | 100.963 |
| -4.390000000000077 | 64.748 | 80.64 | 100.434 |
| -4.385000000000077 | 64.441 | 80.238 | 99.908 |
| -4.380000000000077 | 64.136 | 79.838 | 99.385 |
| -4.375000000000077 | 63.832 | 79.44 | 98.864 |
| -4.370000000000077 | 63.529 | 79.044 | 98.347 |
| -4.365000000000077 | 63.228 | 78.649 | 97.832 |
| -4.360000000000078 | 62.929 | 78.257 | 97.32 |
| -4.355000000000078 | 62.63 | 77.867 | 96.81 |
| -4.350000000000078 | 62.334 | 77.478 | 96.303 |
| -4.345000000000078 | 62.038 | 77.092 | 95.799 |
| -4.340000000000078 | 61.744 | 76.708 | 95.297 |
| -4.335000000000078 | 61.452 | 76.325 | 94.798 |
| -4.330000000000078 | 61.16 | 75.944 | 94.302 |
| -4.325000000000078 | 60.871 | 75.566 | 93.808 |
| -4.320000000000078 | 60.582 | 75.189 | 93.317 |
| -4.315000000000079 | 60.295 | 74.814 | 92.828 |
| -4.310000000000079 | 60.009 | 74.44 | 92.342 |
| -4.305000000000079 | 59.725 | 74.069 | 91.859 |
| -4.300000000000079 | 59.442 | 73.7 | 91.378 |
| -4.295000000000079 | 59.16 | 73.332 | 90.899 |
| -4.29000000000008 | 58.88 | 72.966 | 90.423 |
| -4.28500000000008 | 58.601 | 72.603 | 89.95 |
| -4.28000000000008 | 58.323 | 72.24 | 89.479 |
| -4.27500000000008 | 58.047 | 71.88 | 89.01 |
| -4.27000000000008 | 57.772 | 71.522 | 88.544 |
| -4.26500000000008 | 57.498 | 71.165 | 88.08 |
| -4.26000000000008 | 57.226 | 70.81 | 87.619 |
| -4.25500000000008 | 56.954 | 70.457 | 87.16 |
| -4.25000000000008 | 56.684 | 70.105 | 86.704 |
| -4.24500000000008 | 56.416 | 69.756 | 86.25 |
| -4.24000000000008 | 56.149 | 69.408 | 85.798 |
| -4.23500000000008 | 55.882 | 69.062 | 85.349 |
| -4.23000000000008 | 55.618 | 68.717 | 84.902 |
| -4.22500000000008 | 55.354 | 68.375 | 84.458 |
| -4.220000000000081 | 55.092 | 68.033 | 84.015 |
| -4.215000000000081 | 54.831 | 67.694 | 83.575 |
| -4.210000000000081 | 54.571 | 67.357 | 83.138 |
| -4.205000000000081 | 54.312 | 67.021 | 82.703 |
| -4.200000000000081 | 54.055 | 66.686 | 82.269 |
| -4.195000000000081 | 53.799 | 66.354 | 81.839 |
| -4.190000000000081 | 53.544 | 66.023 | 81.41 |
| -4.185000000000081 | 53.29 | 65.694 | 80.984 |
| -4.180000000000081 | 53.038 | 65.366 | 80.56 |
| -4.175000000000082 | 52.786 | 65.04 | 80.138 |
| -4.170000000000082 | 52.536 | 64.715 | 79.718 |
| -4.165000000000082 | 52.287 | 64.393 | 79.301 |
| -4.160000000000082 | 52.039 | 64.072 | 78.886 |
| -4.155000000000082 | 51.793 | 63.752 | 78.473 |
| -4.150000000000082 | 51.547 | 63.434 | 78.062 |
| -4.145000000000082 | 51.303 | 63.118 | 77.653 |
| -4.140000000000082 | 51.06 | 62.803 | 77.246 |
| -4.135000000000082 | 50.818 | 62.49 | 76.842 |
| -4.130000000000082 | 50.577 | 62.178 | 76.44 |
| -4.125000000000083 | 50.337 | 61.868 | 76.039 |
| -4.120000000000083 | 50.099 | 61.559 | 75.641 |
| -4.115000000000083 | 49.862 | 61.252 | 75.245 |
| -4.110000000000083 | 49.625 | 60.947 | 74.851 |
| -4.105000000000083 | 49.39 | 60.643 | 74.459 |
| -4.100000000000083 | 49.156 | 60.34 | 74.069 |
| -4.095000000000083 | 48.923 | 60.039 | 73.681 |
| -4.090000000000083 | 48.691 | 59.74 | 73.296 |
| -4.085000000000083 | 48.461 | 59.442 | 72.912 |
| -4.080000000000084 | 48.231 | 59.145 | 72.53 |
| -4.075000000000084 | 48.002 | 58.85 | 72.15 |
| -4.070000000000084 | 47.775 | 58.557 | 71.772 |
| -4.065000000000084 | 47.548 | 58.265 | 71.397 |
| -4.060000000000084 | 47.323 | 57.974 | 71.023 |
| -4.055000000000084 | 47.099 | 57.685 | 70.651 |
| -4.050000000000084 | 46.876 | 57.397 | 70.281 |
| -4.045000000000084 | 46.654 | 57.111 | 69.913 |
| -4.040000000000084 | 46.433 | 56.826 | 69.547 |
| -4.035000000000084 | 46.212 | 56.543 | 69.183 |
| -4.030000000000084 | 45.993 | 56.261 | 68.82 |
| -4.025000000000085 | 45.776 | 55.98 | 68.46 |
| -4.020000000000085 | 45.559 | 55.701 | 68.102 |
| -4.015000000000085 | 45.343 | 55.423 | 67.745 |
| -4.010000000000085 | 45.128 | 55.147 | 67.39 |
| -4.005000000000085 | 44.914 | 54.872 | 67.037 |
| -4.000000000000085 | 44.701 | 54.598 | 66.686 |
| -3.995000000000085 | 44.489 | 54.326 | 66.337 |
| -3.990000000000085 | 44.279 | 54.055 | 65.99 |
| -3.985000000000086 | 44.069 | 53.785 | 65.644 |
| -3.980000000000086 | 43.86 | 53.517 | 65.301 |
| -3.975000000000086 | 43.652 | 53.25 | 64.959 |
| -3.970000000000086 | 43.445 | 52.985 | 64.618 |
| -3.965000000000086 | 43.239 | 52.72 | 64.28 |
| -3.960000000000086 | 43.034 | 52.457 | 63.944 |
| -3.955000000000086 | 42.83 | 52.196 | 63.609 |
| -3.950000000000086 | 42.628 | 51.935 | 63.276 |
| -3.945000000000086 | 42.426 | 51.676 | 62.944 |
| -3.940000000000087 | 42.224 | 51.419 | 62.615 |
| -3.935000000000087 | 42.024 | 51.162 | 62.287 |
| -3.930000000000087 | 41.825 | 50.907 | 61.961 |
| -3.925000000000087 | 41.627 | 50.653 | 61.636 |
| -3.920000000000087 | 41.43 | 50.4 | 61.313 |
| -3.915000000000087 | 41.233 | 50.149 | 60.992 |
| -3.910000000000087 | 41.038 | 49.899 | 60.673 |
| -3.905000000000087 | 40.844 | 49.65 | 60.355 |
| -3.900000000000087 | 40.65 | 49.402 | 60.039 |
| -3.895000000000087 | 40.457 | 49.156 | 59.725 |
| -3.890000000000088 | 40.266 | 48.911 | 59.412 |
| -3.885000000000088 | 40.075 | 48.667 | 59.101 |
| -3.880000000000088 | 39.885 | 48.424 | 58.792 |
| -3.875000000000088 | 39.696 | 48.183 | 58.484 |
| -3.870000000000088 | 39.508 | 47.942 | 58.178 |
| -3.865000000000088 | 39.321 | 47.703 | 57.873 |
| -3.860000000000088 | 39.134 | 47.465 | 57.57 |
| -3.855000000000088 | 38.949 | 47.229 | 57.268 |
| -3.850000000000088 | 38.764 | 46.993 | 56.969 |
| -3.845000000000089 | 38.581 | 46.759 | 56.67 |
| -3.840000000000089 | 38.398 | 46.525 | 56.374 |
| -3.835000000000089 | 38.216 | 46.293 | 56.078 |
| -3.830000000000089 | 38.035 | 46.063 | 55.785 |
| -3.825000000000089 | 37.855 | 45.833 | 55.493 |
| -3.820000000000089 | 37.675 | 45.604 | 55.202 |
| -3.815000000000089 | 37.497 | 45.377 | 54.913 |
| -3.810000000000089 | 37.319 | 45.15 | 54.625 |
| -3.805000000000089 | 37.142 | 44.925 | 54.339 |
| -3.800000000000089 | 36.966 | 44.701 | 54.055 |
| -3.79500000000009 | 36.791 | 44.478 | 53.772 |
| -3.79000000000009 | 36.617 | 44.256 | 53.49 |
| -3.78500000000009 | 36.443 | 44.036 | 53.21 |
| -3.78000000000009 | 36.27 | 43.816 | 52.932 |
| -3.77500000000009 | 36.098 | 43.598 | 52.654 |
| -3.77000000000009 | 35.927 | 43.38 | 52.379 |
| -3.76500000000009 | 35.757 | 43.164 | 52.104 |
| -3.76000000000009 | 35.588 | 42.948 | 51.832 |
| -3.75500000000009 | 35.419 | 42.734 | 51.56 |
| -3.750000000000091 | 35.251 | 42.521 | 51.29 |
| -3.745000000000091 | 35.084 | 42.309 | 51.022 |
| -3.740000000000091 | 34.918 | 42.098 | 50.754 |
| -3.735000000000091 | 34.752 | 41.888 | 50.489 |
| -3.730000000000091 | 34.588 | 41.679 | 50.224 |
| -3.725000000000091 | 34.424 | 41.471 | 49.961 |
| -3.720000000000091 | 34.261 | 41.264 | 49.7 |
| -3.715000000000091 | 34.098 | 41.059 | 49.44 |
| -3.710000000000091 | 33.937 | 40.854 | 49.181 |
| -3.705000000000091 | 33.776 | 40.65 | 48.923 |
| -3.700000000000092 | 33.616 | 40.447 | 48.667 |
| -3.695000000000092 | 33.457 | 40.246 | 48.412 |
| -3.690000000000092 | 33.298 | 40.045 | 48.159 |
| -3.685000000000092 | 33.14 | 39.845 | 47.906 |
| -3.680000000000092 | 32.983 | 39.646 | 47.656 |
| -3.675000000000092 | 32.827 | 39.449 | 47.406 |
| -3.670000000000092 | 32.671 | 39.252 | 47.158 |
| -3.665000000000092 | 32.517 | 39.056 | 46.911 |
| -3.660000000000092 | 32.362 | 38.861 | 46.665 |
| -3.655000000000093 | 32.209 | 38.668 | 46.421 |
| -3.650000000000093 | 32.057 | 38.475 | 46.178 |
| -3.645000000000093 | 31.905 | 38.283 | 45.936 |
| -3.640000000000093 | 31.753 | 38.092 | 45.696 |
| -3.635000000000093 | 31.603 | 37.902 | 45.456 |
| -3.630000000000093 | 31.453 | 37.713 | 45.218 |
| -3.625000000000093 | 31.304 | 37.525 | 44.981 |
| -3.620000000000093 | 31.156 | 37.338 | 44.746 |
| -3.615000000000093 | 31.008 | 37.151 | 44.512 |
| -3.610000000000093 | 30.861 | 36.966 | 44.279 |
| -3.605000000000094 | 30.715 | 36.782 | 44.047 |
| -3.600000000000094 | 30.569 | 36.598 | 43.816 |
| -3.595000000000094 | 30.425 | 36.416 | 43.587 |
| -3.590000000000094 | 30.28 | 36.234 | 43.358 |
| -3.585000000000094 | 30.137 | 36.053 | 43.131 |
| -3.580000000000094 | 29.994 | 35.874 | 42.905 |
| -3.575000000000094 | 29.852 | 35.695 | 42.681 |
| -3.570000000000094 | 29.71 | 35.517 | 42.457 |
| -3.565000000000095 | 29.57 | 35.339 | 42.235 |
| -3.560000000000095 | 29.43 | 35.163 | 42.014 |
| -3.555000000000095 | 29.29 | 34.988 | 41.794 |
| -3.550000000000095 | 29.151 | 34.813 | 41.575 |
| -3.545000000000095 | 29.013 | 34.64 | 41.357 |
| -3.540000000000095 | 28.876 | 34.467 | 41.141 |
| -3.535000000000095 | 28.739 | 34.295 | 40.925 |
| -3.530000000000095 | 28.603 | 34.124 | 40.711 |
| -3.525000000000095 | 28.467 | 33.954 | 40.498 |
| -3.520000000000095 | 28.332 | 33.784 | 40.286 |
| -3.515000000000096 | 28.198 | 33.616 | 40.075 |
| -3.510000000000096 | 28.064 | 33.448 | 39.865 |
| -3.505000000000096 | 27.931 | 33.281 | 39.656 |
| -3.500000000000096 | 27.799 | 33.115 | 39.449 |
| -3.495000000000096 | 27.667 | 32.95 | 39.242 |
| -3.490000000000096 | 27.536 | 32.786 | 39.037 |
| -3.485000000000096 | 27.406 | 32.622 | 38.832 |
| -3.480000000000096 | 27.276 | 32.46 | 38.629 |
| -3.475000000000096 | 27.147 | 32.298 | 38.427 |
| -3.470000000000097 | 27.018 | 32.137 | 38.225 |
| -3.465000000000097 | 26.89 | 31.976 | 38.025 |
| -3.460000000000097 | 26.762 | 31.817 | 37.826 |
| -3.455000000000097 | 26.636 | 31.658 | 37.628 |
| -3.450000000000097 | 26.509 | 31.5 | 37.431 |
| -3.445000000000097 | 26.384 | 31.343 | 37.235 |
| -3.440000000000097 | 26.259 | 31.187 | 37.04 |
| -3.435000000000097 | 26.134 | 31.031 | 36.846 |
| -3.430000000000097 | 26.01 | 30.877 | 36.653 |
| -3.425000000000097 | 25.887 | 30.723 | 36.461 |
| -3.420000000000098 | 25.765 | 30.569 | 36.27 |
| -3.415000000000098 | 25.642 | 30.417 | 36.08 |
| -3.410000000000098 | 25.521 | 30.265 | 35.891 |
| -3.405000000000098 | 25.4 | 30.114 | 35.704 |
| -3.400000000000098 | 25.28 | 29.964 | 35.517 |
| -3.395000000000098 | 25.16 | 29.815 | 35.331 |
| -3.390000000000098 | 25.041 | 29.666 | 35.146 |
| -3.385000000000098 | 24.922 | 29.518 | 34.962 |
| -3.380000000000098 | 24.804 | 29.371 | 34.779 |
| -3.375000000000099 | 24.686 | 29.224 | 34.596 |
| -3.370000000000099 | 24.569 | 29.079 | 34.415 |
| -3.365000000000099 | 24.453 | 28.933 | 34.235 |
| -3.360000000000099 | 24.337 | 28.789 | 34.056 |
| -3.355000000000099 | 24.222 | 28.646 | 33.877 |
| -3.350000000000099 | 24.107 | 28.503 | 33.7 |
| -3.345000000000099 | 23.993 | 28.361 | 33.524 |
| -3.340000000000099 | 23.879 | 28.219 | 33.348 |
| -3.335000000000099 | 23.766 | 28.078 | 33.173 |
| -3.330000000000099 | 23.653 | 27.938 | 33 |
| -3.3250000000001 | 23.541 | 27.799 | 32.827 |
| -3.3200000000001 | 23.43 | 27.66 | 32.655 |
| -3.3150000000001 | 23.319 | 27.522 | 32.484 |
| -3.3100000000001 | 23.208 | 27.385 | 32.314 |
| -3.3050000000001 | 23.098 | 27.249 | 32.145 |
| -3.3000000000001 | 22.989 | 27.113 | 31.976 |
| -3.2950000000001 | 22.88 | 26.977 | 31.809 |
| -3.2900000000001 | 22.771 | 26.843 | 31.642 |
| -3.2850000000001 | 22.663 | 26.709 | 31.477 |
| -3.280000000000101 | 22.556 | 26.576 | 31.312 |
| -3.275000000000101 | 22.449 | 26.443 | 31.148 |
| -3.270000000000101 | 22.343 | 26.311 | 30.985 |
| -3.265000000000101 | 22.237 | 26.18 | 30.823 |
| -3.260000000000101 | 22.131 | 26.05 | 30.661 |
| -3.255000000000101 | 22.027 | 25.92 | 30.501 |
| -3.250000000000101 | 21.922 | 25.79 | 30.341 |
| -3.245000000000101 | 21.818 | 25.662 | 30.182 |
| -3.240000000000101 | 21.715 | 25.534 | 30.024 |
| -3.235000000000102 | 21.612 | 25.406 | 29.867 |
| -3.230000000000102 | 21.51 | 25.28 | 29.71 |
| -3.225000000000102 | 21.408 | 25.154 | 29.555 |
| -3.220000000000102 | 21.306 | 25.028 | 29.4 |
| -3.215000000000102 | 21.205 | 24.903 | 29.246 |
| -3.210000000000102 | 21.105 | 24.779 | 29.093 |
| -3.205000000000102 | 21.005 | 24.656 | 28.941 |
| -3.200000000000102 | 20.905 | 24.533 | 28.789 |
| -3.195000000000102 | 20.806 | 24.41 | 28.638 |
| -3.190000000000103 | 20.708 | 24.288 | 28.488 |
| -3.185000000000103 | 20.609 | 24.167 | 28.339 |
| -3.180000000000103 | 20.512 | 24.047 | 28.191 |
| -3.175000000000103 | 20.415 | 23.927 | 28.043 |
| -3.170000000000103 | 20.318 | 23.807 | 27.896 |
| -3.165000000000103 | 20.222 | 23.689 | 27.75 |
| -3.160000000000103 | 20.126 | 23.571 | 27.605 |
| -3.155000000000103 | 20.03 | 23.453 | 27.461 |
| -3.150000000000103 | 19.935 | 23.336 | 27.317 |
| -3.145000000000103 | 19.841 | 23.22 | 27.174 |
| -3.140000000000104 | 19.747 | 23.104 | 27.031 |
| -3.135000000000104 | 19.653 | 22.989 | 26.89 |
| -3.130000000000104 | 19.56 | 22.874 | 26.749 |
| -3.125000000000104 | 19.468 | 22.76 | 26.609 |
| -3.120000000000104 | 19.375 | 22.646 | 26.47 |
| -3.115000000000104 | 19.284 | 22.533 | 26.331 |
| -3.110000000000104 | 19.192 | 22.421 | 26.193 |
| -3.105000000000104 | 19.101 | 22.309 | 26.056 |
| -3.100000000000104 | 19.011 | 22.198 | 25.92 |
| -3.095000000000105 | 18.921 | 22.087 | 25.784 |
| -3.090000000000105 | 18.831 | 21.977 | 25.649 |
| -3.085000000000105 | 18.742 | 21.867 | 25.515 |
| -3.080000000000105 | 18.653 | 21.758 | 25.381 |
| -3.075000000000105 | 18.564 | 21.65 | 25.248 |
| -3.070000000000105 | 18.477 | 21.542 | 25.116 |
| -3.065000000000105 | 18.389 | 21.434 | 24.984 |
| -3.060000000000105 | 18.302 | 21.328 | 24.854 |
| -3.055000000000105 | 18.215 | 21.221 | 24.723 |
| -3.050000000000106 | 18.129 | 21.115 | 24.594 |
| -3.045000000000106 | 18.043 | 21.01 | 24.465 |
| -3.040000000000106 | 17.957 | 20.905 | 24.337 |
| -3.035000000000106 | 17.872 | 20.801 | 24.21 |
| -3.030000000000106 | 17.788 | 20.697 | 24.083 |
| -3.025000000000106 | 17.703 | 20.594 | 23.957 |
| -3.020000000000106 | 17.619 | 20.491 | 23.831 |
| -3.015000000000106 | 17.536 | 20.389 | 23.707 |
| -3.010000000000106 | 17.453 | 20.287 | 23.582 |
| -3.005000000000106 | 17.37 | 20.186 | 23.459 |
| -3.000000000000107 | 17.288 | 20.086 | 23.336 |
| -2.995000000000107 | 17.206 | 19.985 | 23.214 |
| -2.990000000000107 | 17.124 | 19.886 | 23.092 |
| -2.985000000000107 | 17.043 | 19.787 | 22.971 |
| -2.980000000000107 | 16.962 | 19.688 | 22.851 |
| -2.975000000000107 | 16.882 | 19.59 | 22.731 |
| -2.970000000000107 | 16.802 | 19.492 | 22.612 |
| -2.965000000000107 | 16.722 | 19.395 | 22.494 |
| -2.960000000000107 | 16.643 | 19.298 | 22.376 |
| -2.955000000000108 | 16.564 | 19.202 | 22.259 |
| -2.950000000000108 | 16.486 | 19.106 | 22.143 |
| -2.945000000000108 | 16.408 | 19.011 | 22.027 |
| -2.940000000000108 | 16.33 | 18.916 | 21.911 |
| -2.935000000000108 | 16.253 | 18.822 | 21.797 |
| -2.930000000000108 | 16.176 | 18.728 | 21.682 |
| -2.925000000000108 | 16.099 | 18.634 | 21.569 |
| -2.920000000000108 | 16.023 | 18.541 | 21.456 |
| -2.915000000000108 | 15.947 | 18.449 | 21.344 |
| -2.910000000000108 | 15.871 | 18.357 | 21.232 |
| -2.905000000000109 | 15.796 | 18.265 | 21.121 |
| -2.900000000000109 | 15.721 | 18.174 | 21.01 |
| -2.895000000000109 | 15.647 | 18.084 | 20.9 |
| -2.890000000000109 | 15.572 | 17.993 | 20.791 |
| -2.885000000000109 | 15.499 | 17.904 | 20.682 |
| -2.880000000000109 | 15.425 | 17.814 | 20.573 |
| -2.875000000000109 | 15.352 | 17.725 | 20.466 |
| -2.870000000000109 | 15.279 | 17.637 | 20.359 |
| -2.865000000000109 | 15.207 | 17.549 | 20.252 |
| -2.86000000000011 | 15.135 | 17.462 | 20.146 |
| -2.85500000000011 | 15.063 | 17.374 | 20.04 |
| -2.85000000000011 | 14.992 | 17.288 | 19.935 |
| -2.84500000000011 | 14.921 | 17.202 | 19.831 |
| -2.84000000000011 | 14.85 | 17.116 | 19.727 |
| -2.83500000000011 | 14.78 | 17.03 | 19.624 |
| -2.83000000000011 | 14.71 | 16.945 | 19.521 |
| -2.82500000000011 | 14.64 | 16.861 | 19.419 |
| -2.82000000000011 | 14.571 | 16.777 | 19.317 |
| -2.81500000000011 | 14.501 | 16.693 | 19.216 |
| -2.810000000000111 | 14.433 | 16.61 | 19.116 |
| -2.805000000000111 | 14.364 | 16.527 | 19.015 |
| -2.800000000000111 | 14.296 | 16.445 | 18.916 |
| -2.795000000000111 | 14.229 | 16.363 | 18.817 |
| -2.790000000000111 | 14.161 | 16.281 | 18.718 |
| -2.785000000000111 | 14.094 | 16.2 | 18.62 |
| -2.780000000000111 | 14.027 | 16.119 | 18.523 |
| -2.775000000000111 | 13.961 | 16.039 | 18.426 |
| -2.770000000000111 | 13.895 | 15.959 | 18.329 |
| -2.765000000000112 | 13.829 | 15.879 | 18.233 |
| -2.760000000000112 | 13.763 | 15.8 | 18.138 |
| -2.755000000000112 | 13.698 | 15.721 | 18.043 |
| -2.750000000000112 | 13.633 | 15.643 | 17.948 |
| -2.745000000000112 | 13.568 | 15.565 | 17.854 |
| -2.740000000000112 | 13.504 | 15.487 | 17.761 |
| -2.735000000000112 | 13.44 | 15.41 | 17.668 |
| -2.730000000000112 | 13.377 | 15.333 | 17.575 |
| -2.725000000000112 | 13.313 | 15.256 | 17.483 |
| -2.720000000000112 | 13.25 | 15.18 | 17.392 |
| -2.715000000000113 | 13.187 | 15.105 | 17.301 |
| -2.710000000000113 | 13.125 | 15.029 | 17.21 |
| -2.705000000000113 | 13.063 | 14.954 | 17.12 |
| -2.700000000000113 | 13.001 | 14.88 | 17.03 |
| -2.695000000000113 | 12.939 | 14.806 | 16.941 |
| -2.690000000000113 | 12.878 | 14.732 | 16.853 |
| -2.685000000000113 | 12.817 | 14.658 | 16.764 |
| -2.680000000000113 | 12.756 | 14.585 | 16.676 |
| -2.675000000000113 | 12.696 | 14.512 | 16.589 |
| -2.670000000000114 | 12.635 | 14.44 | 16.502 |
| -2.665000000000114 | 12.575 | 14.368 | 16.416 |
| -2.660000000000114 | 12.516 | 14.296 | 16.33 |
| -2.655000000000114 | 12.457 | 14.225 | 16.244 |
| -2.650000000000114 | 12.398 | 14.154 | 16.159 |
| -2.645000000000114 | 12.339 | 14.083 | 16.075 |
| -2.640000000000114 | 12.28 | 14.013 | 15.991 |
| -2.635000000000114 | 12.222 | 13.943 | 15.907 |
| -2.630000000000114 | 12.164 | 13.874 | 15.824 |
| -2.625000000000114 | 12.107 | 13.805 | 15.741 |
| -2.620000000000115 | 12.049 | 13.736 | 15.658 |
| -2.615000000000115 | 11.992 | 13.667 | 15.576 |
| -2.610000000000115 | 11.935 | 13.599 | 15.495 |
| -2.605000000000115 | 11.879 | 13.531 | 15.414 |
| -2.600000000000115 | 11.822 | 13.464 | 15.333 |
| -2.595000000000115 | 11.766 | 13.397 | 15.253 |
| -2.590000000000115 | 11.711 | 13.33 | 15.173 |
| -2.585000000000115 | 11.655 | 13.263 | 15.093 |
| -2.580000000000116 | 11.6 | 13.197 | 15.014 |
| -2.575000000000116 | 11.545 | 13.131 | 14.936 |
| -2.570000000000116 | 11.49 | 13.066 | 14.857 |
| -2.565000000000116 | 11.436 | 13.001 | 14.78 |
| -2.560000000000116 | 11.382 | 12.936 | 14.702 |
| -2.555000000000116 | 11.328 | 12.871 | 14.625 |
| -2.550000000000116 | 11.274 | 12.807 | 14.549 |
| -2.545000000000116 | 11.221 | 12.743 | 14.472 |
| -2.540000000000116 | 11.167 | 12.68 | 14.397 |
| -2.535000000000116 | 11.114 | 12.616 | 14.321 |
| -2.530000000000117 | 11.062 | 12.554 | 14.246 |
| -2.525000000000117 | 11.009 | 12.491 | 14.172 |
| -2.520000000000117 | 10.957 | 12.429 | 14.098 |
| -2.515000000000117 | 10.905 | 12.367 | 14.024 |
| -2.510000000000117 | 10.854 | 12.305 | 13.95 |
| -2.505000000000117 | 10.802 | 12.244 | 13.877 |
| -2.500000000000117 | 10.751 | 12.182 | 13.805 |
| -2.495000000000117 | 10.7 | 12.122 | 13.732 |
| -2.490000000000117 | 10.649 | 12.061 | 13.66 |
| -2.485000000000118 | 10.599 | 12.001 | 13.589 |
| -2.480000000000118 | 10.549 | 11.941 | 13.518 |
| -2.475000000000118 | 10.499 | 11.882 | 13.447 |
| -2.470000000000118 | 10.449 | 11.822 | 13.377 |
| -2.465000000000118 | 10.399 | 11.763 | 13.306 |
| -2.460000000000118 | 10.35 | 11.705 | 13.237 |
| -2.455000000000118 | 10.301 | 11.646 | 13.167 |
| -2.450000000000118 | 10.252 | 11.588 | 13.099 |
| -2.445000000000118 | 10.204 | 11.531 | 13.03 |
| -2.440000000000118 | 10.155 | 11.473 | 12.962 |
| -2.435000000000119 | 10.107 | 11.416 | 12.894 |
| -2.430000000000119 | 10.059 | 11.359 | 12.826 |
| -2.425000000000119 | 10.012 | 11.302 | 12.759 |
| -2.420000000000119 | 9.964 | 11.246 | 12.692 |
| -2.415000000000119 | 9.917 | 11.19 | 12.626 |
| -2.410000000000119 | 9.87 | 11.134 | 12.56 |
| -2.405000000000119 | 9.823 | 11.078 | 12.494 |
| -2.400000000000119 | 9.777 | 11.023 | 12.429 |
| -2.395000000000119 | 9.73 | 10.968 | 12.364 |
| -2.39000000000012 | 9.684 | 10.913 | 12.299 |
| -2.38500000000012 | 9.638 | 10.859 | 12.234 |
| -2.38000000000012 | 9.593 | 10.805 | 12.17 |
| -2.37500000000012 | 9.547 | 10.751 | 12.107 |
| -2.37000000000012 | 9.502 | 10.697 | 12.043 |
| -2.36500000000012 | 9.457 | 10.644 | 11.98 |
| -2.36000000000012 | 9.412 | 10.591 | 11.917 |
| -2.35500000000012 | 9.368 | 10.538 | 11.855 |
| -2.35000000000012 | 9.323 | 10.486 | 11.793 |
| -2.34500000000012 | 9.279 | 10.433 | 11.731 |
| -2.340000000000121 | 9.235 | 10.381 | 11.67 |
| -2.335000000000121 | 9.191 | 10.329 | 11.609 |
| -2.330000000000121 | 9.148 | 10.278 | 11.548 |
| -2.325000000000121 | 9.104 | 10.227 | 11.487 |
| -2.320000000000121 | 9.061 | 10.176 | 11.427 |
| -2.315000000000121 | 9.018 | 10.125 | 11.367 |
| -2.310000000000121 | 8.976 | 10.074 | 11.308 |
| -2.305000000000121 | 8.933 | 10.024 | 11.249 |
| -2.300000000000121 | 8.891 | 9.974 | 11.19 |
| -2.295000000000122 | 8.849 | 9.924 | 11.131 |
| -2.290000000000122 | 8.807 | 9.875 | 11.073 |
| -2.285000000000122 | 8.765 | 9.826 | 11.015 |
| -2.280000000000122 | 8.723 | 9.777 | 10.957 |
| -2.275000000000122 | 8.682 | 9.728 | 10.9 |
| -2.270000000000122 | 8.641 | 9.679 | 10.843 |
| -2.265000000000122 | 8.6 | 9.631 | 10.786 |
| -2.260000000000122 | 8.559 | 9.583 | 10.73 |
| -2.255000000000122 | 8.519 | 9.535 | 10.673 |
| -2.250000000000123 | 8.478 | 9.488 | 10.617 |
| -2.245000000000123 | 8.438 | 9.44 | 10.562 |
| -2.240000000000123 | 8.398 | 9.393 | 10.507 |
| -2.235000000000123 | 8.358 | 9.346 | 10.452 |
| -2.230000000000123 | 8.319 | 9.3 | 10.397 |
| -2.225000000000123 | 8.279 | 9.253 | 10.342 |
| -2.220000000000123 | 8.24 | 9.207 | 10.288 |
| -2.215000000000123 | 8.201 | 9.161 | 10.234 |
| -2.210000000000123 | 8.162 | 9.116 | 10.181 |
| -2.205000000000124 | 8.123 | 9.07 | 10.127 |
| -2.200000000000124 | 8.085 | 9.025 | 10.074 |
| -2.195000000000124 | 8.047 | 8.98 | 10.022 |
| -2.190000000000124 | 8.008 | 8.935 | 9.969 |
| -2.185000000000124 | 7.971 | 8.891 | 9.917 |
| -2.180000000000124 | 7.933 | 8.846 | 9.865 |
| -2.175000000000124 | 7.895 | 8.802 | 9.813 |
| -2.170000000000124 | 7.858 | 8.758 | 9.762 |
| -2.165000000000124 | 7.821 | 8.715 | 9.711 |
| -2.160000000000124 | 7.783 | 8.671 | 9.66 |
| -2.155000000000125 | 7.747 | 8.628 | 9.609 |
| -2.150000000000125 | 7.71 | 8.585 | 9.559 |
| -2.145000000000125 | 7.673 | 8.542 | 9.509 |
| -2.140000000000125 | 7.637 | 8.499 | 9.459 |
| -2.135000000000125 | 7.601 | 8.457 | 9.41 |
| -2.130000000000125 | 7.565 | 8.415 | 9.361 |
| -2.125000000000125 | 7.529 | 8.373 | 9.311 |
| -2.120000000000125 | 7.493 | 8.331 | 9.263 |
| -2.115000000000125 | 7.458 | 8.29 | 9.214 |
| -2.110000000000126 | 7.422 | 8.248 | 9.166 |
| -2.105000000000126 | 7.387 | 8.207 | 9.118 |
| -2.100000000000126 | 7.352 | 8.166 | 9.07 |
| -2.095000000000126 | 7.317 | 8.125 | 9.023 |
| -2.090000000000126 | 7.283 | 8.085 | 8.976 |
| -2.085000000000126 | 7.248 | 8.045 | 8.929 |
| -2.080000000000126 | 7.214 | 8.004 | 8.882 |
| -2.075000000000126 | 7.18 | 7.965 | 8.835 |
| -2.070000000000126 | 7.146 | 7.925 | 8.789 |
| -2.065000000000126 | 7.112 | 7.885 | 8.743 |
| -2.060000000000127 | 7.078 | 7.846 | 8.697 |
| -2.055000000000127 | 7.045 | 7.807 | 8.652 |
| -2.050000000000127 | 7.011 | 7.768 | 8.606 |
| -2.045000000000127 | 6.978 | 7.729 | 8.561 |
| -2.040000000000127 | 6.945 | 7.691 | 8.516 |
| -2.035000000000127 | 6.912 | 7.652 | 8.472 |
| -2.030000000000127 | 6.879 | 7.614 | 8.427 |
| -2.025000000000127 | 6.847 | 7.576 | 8.383 |
| -2.020000000000127 | 6.814 | 7.538 | 8.339 |
| -2.015000000000128 | 6.782 | 7.501 | 8.296 |
| -2.010000000000128 | 6.75 | 7.463 | 8.252 |
| -2.005000000000128 | 6.718 | 7.426 | 8.209 |
| -2.000000000000128 | 6.686 | 7.389 | 8.166 |
| -1.995000000000128 | 6.654 | 7.352 | 8.123 |
| -1.990000000000128 | 6.623 | 7.316 | 8.081 |
| -1.985000000000128 | 6.591 | 7.279 | 8.039 |
| -1.980000000000128 | 6.56 | 7.243 | 7.996 |
| -1.975000000000128 | 6.529 | 7.207 | 7.955 |
| -1.970000000000129 | 6.498 | 7.171 | 7.913 |
| -1.965000000000129 | 6.467 | 7.135 | 7.872 |
| -1.960000000000129 | 6.437 | 7.099 | 7.83 |
| -1.955000000000129 | 6.406 | 7.064 | 7.789 |
| -1.950000000000129 | 6.376 | 7.029 | 7.749 |
| -1.945000000000129 | 6.346 | 6.994 | 7.708 |
| -1.940000000000129 | 6.315 | 6.959 | 7.668 |
| -1.935000000000129 | 6.286 | 6.924 | 7.627 |
| -1.930000000000129 | 6.256 | 6.89 | 7.587 |
| -1.925000000000129 | 6.226 | 6.855 | 7.548 |
| -1.92000000000013 | 6.197 | 6.821 | 7.508 |
| -1.91500000000013 | 6.167 | 6.787 | 7.469 |
| -1.91000000000013 | 6.138 | 6.753 | 7.43 |
| -1.90500000000013 | 6.109 | 6.719 | 7.391 |
| -1.90000000000013 | 6.08 | 6.686 | 7.352 |
| -1.89500000000013 | 6.051 | 6.653 | 7.314 |
| -1.89000000000013 | 6.022 | 6.619 | 7.275 |
| -1.88500000000013 | 5.994 | 6.586 | 7.237 |
| -1.88000000000013 | 5.966 | 6.554 | 7.199 |
| -1.875000000000131 | 5.937 | 6.521 | 7.162 |
| -1.870000000000131 | 5.909 | 6.488 | 7.124 |
| -1.865000000000131 | 5.881 | 6.456 | 7.087 |
| -1.860000000000131 | 5.853 | 6.424 | 7.05 |
| -1.855000000000131 | 5.826 | 6.392 | 7.013 |
| -1.850000000000131 | 5.798 | 6.36 | 6.976 |
| -1.845000000000131 | 5.77 | 6.328 | 6.94 |
| -1.840000000000131 | 5.743 | 6.297 | 6.903 |
| -1.835000000000131 | 5.716 | 6.265 | 6.867 |
| -1.830000000000131 | 5.689 | 6.234 | 6.831 |
| -1.825000000000132 | 5.662 | 6.203 | 6.795 |
| -1.820000000000132 | 5.635 | 6.172 | 6.76 |
| -1.815000000000132 | 5.608 | 6.141 | 6.724 |
| -1.810000000000132 | 5.582 | 6.11 | 6.689 |
| -1.805000000000132 | 5.555 | 6.08 | 6.654 |
| -1.800000000000132 | 5.529 | 6.05 | 6.619 |
| -1.795000000000132 | 5.503 | 6.019 | 6.585 |
| -1.790000000000132 | 5.477 | 5.989 | 6.55 |
| -1.785000000000132 | 5.451 | 5.96 | 6.516 |
| -1.780000000000133 | 5.425 | 5.93 | 6.482 |
| -1.775000000000133 | 5.399 | 5.9 | 6.448 |
| -1.770000000000133 | 5.374 | 5.871 | 6.414 |
| -1.765000000000133 | 5.348 | 5.842 | 6.381 |
| -1.760000000000133 | 5.323 | 5.812 | 6.347 |
| -1.755000000000133 | 5.298 | 5.783 | 6.314 |
| -1.750000000000133 | 5.272 | 5.755 | 6.281 |
| -1.745000000000133 | 5.247 | 5.726 | 6.248 |
| -1.740000000000133 | 5.223 | 5.697 | 6.215 |
| -1.735000000000133 | 5.198 | 5.669 | 6.183 |
| -1.730000000000134 | 5.173 | 5.641 | 6.15 |
| -1.725000000000134 | 5.149 | 5.613 | 6.118 |
| -1.720000000000134 | 5.124 | 5.585 | 6.086 |
| -1.715000000000134 | 5.1 | 5.557 | 6.054 |
| -1.710000000000134 | 5.076 | 5.529 | 6.022 |
| -1.705000000000134 | 5.052 | 5.501 | 5.991 |
| -1.700000000000134 | 5.028 | 5.474 | 5.96 |
| -1.695000000000134 | 5.004 | 5.447 | 5.928 |
| -1.690000000000134 | 4.98 | 5.419 | 5.897 |
| -1.685000000000135 | 4.957 | 5.392 | 5.866 |
| -1.680000000000135 | 4.933 | 5.366 | 5.836 |
| -1.675000000000135 | 4.91 | 5.339 | 5.805 |
| -1.670000000000135 | 4.887 | 5.312 | 5.775 |
| -1.665000000000135 | 4.863 | 5.286 | 5.745 |
| -1.660000000000135 | 4.84 | 5.259 | 5.714 |
| -1.655000000000135 | 4.817 | 5.233 | 5.685 |
| -1.650000000000135 | 4.795 | 5.207 | 5.655 |
| -1.645000000000135 | 4.772 | 5.181 | 5.625 |
| -1.640000000000135 | 4.749 | 5.155 | 5.596 |
| -1.635000000000136 | 4.727 | 5.129 | 5.566 |
| -1.630000000000136 | 4.704 | 5.104 | 5.537 |
| -1.625000000000136 | 4.682 | 5.078 | 5.508 |
| -1.620000000000136 | 4.66 | 5.053 | 5.479 |
| -1.615000000000136 | 4.638 | 5.028 | 5.451 |
| -1.610000000000136 | 4.616 | 5.003 | 5.422 |
| -1.605000000000136 | 4.594 | 4.978 | 5.394 |
| -1.600000000000136 | 4.572 | 4.953 | 5.366 |
| -1.595000000000137 | 4.551 | 4.928 | 5.337 |
| -1.590000000000137 | 4.529 | 4.904 | 5.31 |
| -1.585000000000137 | 4.508 | 4.879 | 5.282 |
| -1.580000000000137 | 4.486 | 4.855 | 5.254 |
| -1.575000000000137 | 4.465 | 4.831 | 5.227 |
| -1.570000000000137 | 4.444 | 4.807 | 5.199 |
| -1.565000000000137 | 4.423 | 4.783 | 5.172 |
| -1.560000000000137 | 4.402 | 4.759 | 5.145 |
| -1.555000000000137 | 4.381 | 4.735 | 5.118 |
| -1.550000000000137 | 4.36 | 4.711 | 5.091 |
| -1.545000000000138 | 4.339 | 4.688 | 5.064 |
| -1.540000000000138 | 4.319 | 4.665 | 5.038 |
| -1.535000000000138 | 4.298 | 4.641 | 5.012 |
| -1.530000000000138 | 4.278 | 4.618 | 4.985 |
| -1.525000000000138 | 4.258 | 4.595 | 4.959 |
| -1.520000000000138 | 4.238 | 4.572 | 4.933 |
| -1.515000000000138 | 4.218 | 4.549 | 4.907 |
| -1.510000000000138 | 4.198 | 4.527 | 4.882 |
| -1.505000000000138 | 4.178 | 4.504 | 4.856 |
| -1.500000000000139 | 4.158 | 4.482 | 4.831 |
| -1.495000000000139 | 4.138 | 4.459 | 4.805 |
| -1.490000000000139 | 4.119 | 4.437 | 4.78 |
| -1.485000000000139 | 4.099 | 4.415 | 4.755 |
| -1.480000000000139 | 4.08 | 4.393 | 4.73 |
| -1.475000000000139 | 4.06 | 4.371 | 4.706 |
| -1.470000000000139 | 4.041 | 4.349 | 4.681 |
| -1.465000000000139 | 4.022 | 4.328 | 4.656 |
| -1.460000000000139 | 4.003 | 4.306 | 4.632 |
| -1.455000000000139 | 3.984 | 4.284 | 4.608 |
| -1.45000000000014 | 3.965 | 4.263 | 4.584 |
| -1.44500000000014 | 3.946 | 4.242 | 4.56 |
| -1.44000000000014 | 3.927 | 4.221 | 4.536 |
| -1.43500000000014 | 3.909 | 4.2 | 4.512 |
| -1.43000000000014 | 3.89 | 4.179 | 4.488 |
| -1.42500000000014 | 3.872 | 4.158 | 4.465 |
| -1.42000000000014 | 3.854 | 4.137 | 4.442 |
| -1.41500000000014 | 3.835 | 4.116 | 4.418 |
| -1.41000000000014 | 3.817 | 4.096 | 4.395 |
| -1.405000000000141 | 3.799 | 4.076 | 4.372 |
| -1.400000000000141 | 3.781 | 4.055 | 4.349 |
| -1.395000000000141 | 3.763 | 4.035 | 4.326 |
| -1.390000000000141 | 3.745 | 4.015 | 4.304 |
| -1.385000000000141 | 3.728 | 3.995 | 4.281 |
| -1.380000000000141 | 3.71 | 3.975 | 4.259 |
| -1.375000000000141 | 3.692 | 3.955 | 4.237 |
| -1.370000000000141 | 3.675 | 3.935 | 4.214 |
| -1.365000000000141 | 3.657 | 3.916 | 4.192 |
| -1.360000000000141 | 3.64 | 3.896 | 4.17 |
| -1.355000000000142 | 3.623 | 3.877 | 4.149 |
| -1.350000000000142 | 3.606 | 3.857 | 4.127 |
| -1.345000000000142 | 3.589 | 3.838 | 4.105 |
| -1.340000000000142 | 3.572 | 3.819 | 4.084 |
| -1.335000000000142 | 3.555 | 3.8 | 4.062 |
| -1.330000000000142 | 3.538 | 3.781 | 4.041 |
| -1.325000000000142 | 3.521 | 3.762 | 4.02 |
| -1.320000000000142 | 3.504 | 3.743 | 3.999 |
| -1.315000000000142 | 3.488 | 3.725 | 3.978 |
| -1.310000000000143 | 3.471 | 3.706 | 3.957 |
| -1.305000000000143 | 3.455 | 3.688 | 3.936 |
| -1.300000000000143 | 3.438 | 3.669 | 3.916 |
| -1.295000000000143 | 3.422 | 3.651 | 3.895 |
| -1.290000000000143 | 3.406 | 3.633 | 3.875 |
| -1.285000000000143 | 3.39 | 3.615 | 3.855 |
| -1.280000000000143 | 3.374 | 3.597 | 3.834 |
| -1.275000000000143 | 3.358 | 3.579 | 3.814 |
| -1.270000000000143 | 3.342 | 3.561 | 3.794 |
| -1.265000000000144 | 3.326 | 3.543 | 3.774 |
| -1.260000000000144 | 3.31 | 3.525 | 3.755 |
| -1.255000000000144 | 3.294 | 3.508 | 3.735 |
| -1.250000000000144 | 3.279 | 3.49 | 3.715 |
| -1.245000000000144 | 3.263 | 3.473 | 3.696 |
| -1.240000000000144 | 3.248 | 3.456 | 3.677 |
| -1.235000000000144 | 3.232 | 3.438 | 3.657 |
| -1.230000000000144 | 3.217 | 3.421 | 3.638 |
| -1.225000000000144 | 3.202 | 3.404 | 3.619 |
| -1.220000000000145 | 3.187 | 3.387 | 3.6 |
| -1.215000000000145 | 3.172 | 3.37 | 3.581 |
| -1.210000000000145 | 3.157 | 3.353 | 3.563 |
| -1.205000000000145 | 3.142 | 3.337 | 3.544 |
| -1.200000000000145 | 3.127 | 3.32 | 3.525 |
| -1.195000000000145 | 3.112 | 3.304 | 3.507 |
| -1.190000000000145 | 3.097 | 3.287 | 3.489 |
| -1.185000000000145 | 3.083 | 3.271 | 3.47 |
| -1.180000000000145 | 3.068 | 3.254 | 3.452 |
| -1.175000000000145 | 3.053 | 3.238 | 3.434 |
| -1.170000000000146 | 3.039 | 3.222 | 3.416 |
| -1.165000000000146 | 3.025 | 3.206 | 3.398 |
| -1.160000000000146 | 3.01 | 3.19 | 3.38 |
| -1.155000000000146 | 2.996 | 3.174 | 3.363 |
| -1.150000000000146 | 2.982 | 3.158 | 3.345 |
| -1.145000000000146 | 2.968 | 3.142 | 3.328 |
| -1.140000000000146 | 2.954 | 3.127 | 3.31 |
| -1.135000000000146 | 2.94 | 3.111 | 3.293 |
| -1.130000000000146 | 2.926 | 3.096 | 3.276 |
| -1.125000000000147 | 2.912 | 3.08 | 3.258 |
| -1.120000000000147 | 2.898 | 3.065 | 3.241 |
| -1.115000000000147 | 2.884 | 3.05 | 3.224 |
| -1.110000000000147 | 2.871 | 3.034 | 3.208 |
| -1.105000000000147 | 2.857 | 3.019 | 3.191 |
| -1.100000000000147 | 2.843 | 3.004 | 3.174 |
| -1.095000000000147 | 2.83 | 2.989 | 3.157 |
| -1.090000000000147 | 2.817 | 2.974 | 3.141 |
| -1.085000000000147 | 2.803 | 2.959 | 3.124 |
| -1.080000000000147 | 2.79 | 2.945 | 3.108 |
| -1.075000000000148 | 2.777 | 2.93 | 3.092 |
| -1.070000000000148 | 2.764 | 2.915 | 3.076 |
| -1.065000000000148 | 2.75 | 2.901 | 3.059 |
| -1.060000000000148 | 2.737 | 2.886 | 3.043 |
| -1.055000000000148 | 2.724 | 2.872 | 3.028 |
| -1.050000000000148 | 2.711 | 2.858 | 3.012 |
| -1.045000000000148 | 2.699 | 2.843 | 2.996 |
| -1.040000000000148 | 2.686 | 2.829 | 2.98 |
| -1.035000000000148 | 2.673 | 2.815 | 2.965 |
| -1.030000000000149 | 2.66 | 2.801 | 2.949 |
| -1.025000000000149 | 2.648 | 2.787 | 2.934 |
| -1.020000000000149 | 2.635 | 2.773 | 2.918 |
| -1.015000000000149 | 2.623 | 2.759 | 2.903 |
| -1.010000000000149 | 2.61 | 2.746 | 2.888 |
| -1.005000000000149 | 2.598 | 2.732 | 2.873 |
| -1.000000000000149 | 2.586 | 2.718 | 2.858 |
| -0.995000000000149 | 2.573 | 2.705 | 2.843 |
| -0.990000000000149 | 2.561 | 2.691 | 2.828 |
| -0.985000000000149 | 2.549 | 2.678 | 2.813 |
| -0.980000000000149 | 2.537 | 2.664 | 2.798 |
| -0.975000000000149 | 2.525 | 2.651 | 2.784 |
| -0.970000000000149 | 2.513 | 2.638 | 2.769 |
| -0.965000000000149 | 2.501 | 2.625 | 2.755 |
| -0.960000000000149 | 2.489 | 2.612 | 2.74 |
| -0.955000000000149 | 2.478 | 2.599 | 2.726 |
| -0.950000000000149 | 2.466 | 2.586 | 2.711 |
| -0.945000000000149 | 2.454 | 2.573 | 2.697 |
| -0.940000000000149 | 2.442 | 2.56 | 2.683 |
| -0.935000000000149 | 2.431 | 2.547 | 2.669 |
| -0.930000000000149 | 2.419 | 2.535 | 2.655 |
| -0.925000000000149 | 2.408 | 2.522 | 2.641 |
| -0.920000000000149 | 2.396 | 2.509 | 2.627 |
| -0.915000000000149 | 2.385 | 2.497 | 2.614 |
| -0.910000000000149 | 2.374 | 2.484 | 2.6 |
| -0.905000000000149 | 2.363 | 2.472 | 2.586 |
| -0.900000000000149 | 2.351 | 2.46 | 2.573 |
| -0.895000000000149 | 2.34 | 2.447 | 2.559 |
| -0.890000000000149 | 2.329 | 2.435 | 2.546 |
| -0.885000000000149 | 2.318 | 2.423 | 2.533 |
| -0.880000000000149 | 2.307 | 2.411 | 2.519 |
| -0.875000000000149 | 2.296 | 2.399 | 2.506 |
| -0.870000000000149 | 2.285 | 2.387 | 2.493 |
| -0.865000000000149 | 2.274 | 2.375 | 2.48 |
| -0.860000000000149 | 2.264 | 2.363 | 2.467 |
| -0.855000000000149 | 2.253 | 2.351 | 2.454 |
| -0.850000000000149 | 2.242 | 2.34 | 2.441 |
| -0.845000000000149 | 2.232 | 2.328 | 2.428 |
| -0.840000000000149 | 2.221 | 2.316 | 2.416 |
| -0.835000000000149 | 2.211 | 2.305 | 2.403 |
| -0.830000000000149 | 2.2 | 2.293 | 2.39 |
| -0.825000000000149 | 2.19 | 2.282 | 2.378 |
| -0.820000000000149 | 2.179 | 2.27 | 2.366 |
| -0.815000000000149 | 2.169 | 2.259 | 2.353 |
| -0.810000000000149 | 2.159 | 2.248 | 2.341 |
| -0.805000000000149 | 2.148 | 2.237 | 2.329 |
| -0.800000000000149 | 2.138 | 2.226 | 2.316 |
| -0.795000000000149 | 2.128 | 2.214 | 2.304 |
| -0.790000000000149 | 2.118 | 2.203 | 2.292 |
| -0.785000000000149 | 2.108 | 2.192 | 2.28 |
| -0.780000000000149 | 2.098 | 2.181 | 2.268 |
| -0.775000000000149 | 2.088 | 2.171 | 2.256 |
| -0.770000000000149 | 2.078 | 2.16 | 2.245 |
| -0.765000000000149 | 2.068 | 2.149 | 2.233 |
| -0.760000000000149 | 2.059 | 2.138 | 2.221 |
| -0.755000000000149 | 2.049 | 2.128 | 2.209 |
| -0.750000000000149 | 2.039 | 2.117 | 2.198 |
| -0.745000000000149 | 2.029 | 2.106 | 2.186 |
| -0.740000000000149 | 2.02 | 2.096 | 2.175 |
| -0.735000000000149 | 2.01 | 2.085 | 2.164 |
| -0.730000000000149 | 2.001 | 2.075 | 2.152 |
| -0.725000000000149 | 1.991 | 2.065 | 2.141 |
| -0.720000000000149 | 1.982 | 2.054 | 2.13 |
| -0.715000000000149 | 1.972 | 2.044 | 2.119 |
| -0.710000000000149 | 1.963 | 2.034 | 2.107 |
| -0.705000000000149 | 1.954 | 2.024 | 2.096 |
| -0.700000000000149 | 1.944 | 2.014 | 2.085 |
| -0.695000000000149 | 1.935 | 2.004 | 2.075 |
| -0.690000000000149 | 1.926 | 1.994 | 2.064 |
| -0.685000000000149 | 1.917 | 1.984 | 2.053 |
| -0.680000000000149 | 1.908 | 1.974 | 2.042 |
| -0.675000000000149 | 1.899 | 1.964 | 2.031 |
| -0.670000000000149 | 1.89 | 1.954 | 2.021 |
| -0.665000000000149 | 1.881 | 1.944 | 2.01 |
| -0.660000000000149 | 1.872 | 1.935 | 2 |
| -0.655000000000149 | 1.863 | 1.925 | 1.989 |
| -0.650000000000149 | 1.854 | 1.916 | 1.979 |
| -0.645000000000149 | 1.845 | 1.906 | 1.968 |
| -0.640000000000149 | 1.837 | 1.896 | 1.958 |
| -0.635000000000149 | 1.828 | 1.887 | 1.948 |
| -0.630000000000149 | 1.819 | 1.878 | 1.938 |
| -0.625000000000149 | 1.811 | 1.868 | 1.928 |
| -0.620000000000149 | 1.802 | 1.859 | 1.917 |
| -0.615000000000149 | 1.794 | 1.85 | 1.907 |
| -0.610000000000149 | 1.785 | 1.84 | 1.897 |
| -0.605000000000149 | 1.777 | 1.831 | 1.887 |
| -0.600000000000149 | 1.768 | 1.822 | 1.878 |
| -0.595000000000149 | 1.76 | 1.813 | 1.868 |
| -0.590000000000149 | 1.752 | 1.804 | 1.858 |
| -0.585000000000149 | 1.743 | 1.795 | 1.848 |
| -0.580000000000149 | 1.735 | 1.786 | 1.839 |
| -0.575000000000149 | 1.727 | 1.777 | 1.829 |
| -0.570000000000149 | 1.719 | 1.768 | 1.819 |
| -0.565000000000149 | 1.71 | 1.759 | 1.81 |
| -0.560000000000149 | 1.702 | 1.751 | 1.8 |
| -0.555000000000149 | 1.694 | 1.742 | 1.791 |
| -0.550000000000149 | 1.686 | 1.733 | 1.782 |
| -0.545000000000149 | 1.678 | 1.725 | 1.772 |
| -0.540000000000149 | 1.67 | 1.716 | 1.763 |
| -0.535000000000149 | 1.662 | 1.707 | 1.754 |
| -0.530000000000149 | 1.655 | 1.699 | 1.745 |
| -0.525000000000149 | 1.647 | 1.69 | 1.735 |
| -0.520000000000149 | 1.639 | 1.682 | 1.726 |
| -0.515000000000149 | 1.631 | 1.674 | 1.717 |
| -0.510000000000149 | 1.623 | 1.665 | 1.708 |
| -0.505000000000149 | 1.616 | 1.657 | 1.699 |
| -0.500000000000149 | 1.608 | 1.649 | 1.69 |
| -0.495000000000149 | 1.6 | 1.64 | 1.682 |
| -0.490000000000149 | 1.593 | 1.632 | 1.673 |
| -0.485000000000149 | 1.585 | 1.624 | 1.664 |
| -0.480000000000149 | 1.578 | 1.616 | 1.655 |
| -0.475000000000149 | 1.57 | 1.608 | 1.647 |
| -0.470000000000149 | 1.563 | 1.6 | 1.638 |
| -0.465000000000149 | 1.555 | 1.592 | 1.629 |
| -0.460000000000149 | 1.548 | 1.584 | 1.621 |
| -0.455000000000149 | 1.541 | 1.576 | 1.612 |
| -0.450000000000149 | 1.533 | 1.568 | 1.604 |
| -0.445000000000149 | 1.526 | 1.56 | 1.596 |
| -0.440000000000149 | 1.519 | 1.553 | 1.587 |
| -0.435000000000149 | 1.512 | 1.545 | 1.579 |
| -0.430000000000149 | 1.505 | 1.537 | 1.571 |
| -0.425000000000149 | 1.497 | 1.53 | 1.562 |
| -0.420000000000149 | 1.49 | 1.522 | 1.554 |
| -0.415000000000149 | 1.483 | 1.514 | 1.546 |
| -0.410000000000149 | 1.476 | 1.507 | 1.538 |
| -0.405000000000149 | 1.469 | 1.499 | 1.53 |
| -0.400000000000149 | 1.462 | 1.492 | 1.522 |
| -0.395000000000149 | 1.455 | 1.484 | 1.514 |
| -0.390000000000149 | 1.448 | 1.477 | 1.506 |
| -0.385000000000149 | 1.442 | 1.47 | 1.498 |
| -0.380000000000149 | 1.435 | 1.462 | 1.49 |
| -0.375000000000149 | 1.428 | 1.455 | 1.483 |
| -0.370000000000149 | 1.421 | 1.448 | 1.475 |
| -0.365000000000149 | 1.414 | 1.441 | 1.467 |
| -0.360000000000149 | 1.408 | 1.433 | 1.459 |
| -0.355000000000149 | 1.401 | 1.426 | 1.452 |
| -0.350000000000149 | 1.394 | 1.419 | 1.444 |
| -0.345000000000149 | 1.388 | 1.412 | 1.437 |
| -0.340000000000149 | 1.381 | 1.405 | 1.429 |
| -0.335000000000149 | 1.375 | 1.398 | 1.422 |
| -0.330000000000149 | 1.368 | 1.391 | 1.414 |
| -0.325000000000149 | 1.362 | 1.384 | 1.407 |
| -0.320000000000149 | 1.355 | 1.377 | 1.399 |
| -0.315000000000149 | 1.349 | 1.37 | 1.392 |
| -0.310000000000149 | 1.342 | 1.363 | 1.385 |
| -0.305000000000149 | 1.336 | 1.357 | 1.377 |
| -0.300000000000149 | 1.33 | 1.35 | 1.37 |
| -0.295000000000149 | 1.323 | 1.343 | 1.363 |
| -0.290000000000149 | 1.317 | 1.336 | 1.356 |
| -0.285000000000149 | 1.311 | 1.33 | 1.349 |
| -0.280000000000149 | 1.305 | 1.323 | 1.342 |
| -0.275000000000149 | 1.299 | 1.317 | 1.335 |
| -0.270000000000149 | 1.292 | 1.31 | 1.328 |
| -0.265000000000149 | 1.286 | 1.303 | 1.321 |
| -0.260000000000149 | 1.28 | 1.297 | 1.314 |
| -0.255000000000149 | 1.274 | 1.29 | 1.307 |
| -0.250000000000149 | 1.268 | 1.284 | 1.3 |
| -0.245000000000149 | 1.262 | 1.278 | 1.293 |
| -0.240000000000149 | 1.256 | 1.271 | 1.287 |
| -0.235000000000149 | 1.25 | 1.265 | 1.28 |
| -0.230000000000149 | 1.244 | 1.259 | 1.273 |
| -0.225000000000149 | 1.238 | 1.252 | 1.266 |
| -0.220000000000149 | 1.232 | 1.246 | 1.26 |
| -0.215000000000149 | 1.227 | 1.24 | 1.253 |
| -0.210000000000148 | 1.221 | 1.234 | 1.247 |
| -0.205000000000148 | 1.215 | 1.228 | 1.24 |
| -0.200000000000148 | 1.209 | 1.221 | 1.234 |
| -0.195000000000148 | 1.204 | 1.215 | 1.227 |
| -0.190000000000148 | 1.198 | 1.209 | 1.221 |
| -0.185000000000148 | 1.192 | 1.203 | 1.214 |
| -0.180000000000148 | 1.186 | 1.197 | 1.208 |
| -0.175000000000148 | 1.181 | 1.191 | 1.202 |
| -0.170000000000148 | 1.175 | 1.185 | 1.195 |
| -0.165000000000148 | 1.17 | 1.179 | 1.189 |
| -0.160000000000148 | 1.164 | 1.174 | 1.183 |
| -0.155000000000148 | 1.159 | 1.168 | 1.177 |
| -0.150000000000148 | 1.153 | 1.162 | 1.171 |
| -0.145000000000148 | 1.148 | 1.156 | 1.164 |
| -0.140000000000148 | 1.142 | 1.15 | 1.158 |
| -0.135000000000148 | 1.137 | 1.145 | 1.152 |
| -0.130000000000148 | 1.131 | 1.139 | 1.146 |
| -0.125000000000148 | 1.126 | 1.133 | 1.14 |
| -0.120000000000148 | 1.121 | 1.127 | 1.134 |
| -0.115000000000148 | 1.115 | 1.122 | 1.128 |
| -0.110000000000148 | 1.11 | 1.116 | 1.122 |
| -0.105000000000148 | 1.105 | 1.111 | 1.117 |
| -0.100000000000148 | 1.1 | 1.105 | 1.111 |
| -0.0950000000001484 | 1.094 | 1.1 | 1.105 |
| -0.0900000000001484 | 1.089 | 1.094 | 1.099 |
| -0.0850000000001484 | 1.084 | 1.089 | 1.093 |
| -0.0800000000001484 | 1.079 | 1.083 | 1.088 |
| -0.0750000000001484 | 1.074 | 1.078 | 1.082 |
| -0.0700000000001484 | 1.069 | 1.073 | 1.076 |
| -0.0650000000001484 | 1.064 | 1.067 | 1.071 |
| -0.0600000000001484 | 1.059 | 1.062 | 1.065 |
| -0.0550000000001484 | 1.054 | 1.057 | 1.059 |
| -0.0500000000001484 | 1.049 | 1.051 | 1.054 |
| -0.0450000000001484 | 1.044 | 1.046 | 1.048 |
| -0.0400000000001484 | 1.039 | 1.041 | 1.043 |
| -0.0350000000001484 | 1.034 | 1.036 | 1.037 |
| -0.0300000000001484 | 1.029 | 1.03 | 1.032 |
| -0.0250000000001484 | 1.024 | 1.025 | 1.027 |
| -0.0200000000001484 | 1.019 | 1.02 | 1.021 |
| -0.0150000000001484 | 1.014 | 1.015 | 1.016 |
| -0.0100000000001484 | 1.01 | 1.01 | 1.011 |
| -0.00500000000014839 | 1.005 | 1.005 | 1.005 |
| -1.48393450305484e-13 | 1 | 1 | 1 |
| 0.00499999999985161 | 0.995 | 0.995 | 0.995 |
| 0.0099999999998516 | 0.991 | 0.99 | 0.99 |
| 0.0149999999998516 | 0.986 | 0.985 | 0.984 |
| 0.0199999999998516 | 0.981 | 0.98 | 0.979 |
| 0.0249999999998516 | 0.977 | 0.975 | 0.974 |
| 0.0299999999998516 | 0.972 | 0.97 | 0.969 |
| 0.0349999999998516 | 0.967 | 0.966 | 0.964 |
| 0.0399999999998516 | 0.963 | 0.961 | 0.959 |
| 0.0449999999998516 | 0.958 | 0.956 | 0.954 |
| 0.0499999999998516 | 0.954 | 0.951 | 0.949 |
| 0.0549999999998516 | 0.949 | 0.946 | 0.944 |
| 0.0599999999998516 | 0.945 | 0.942 | 0.939 |
| 0.0649999999998516 | 0.94 | 0.937 | 0.934 |
| 0.0699999999998516 | 0.936 | 0.932 | 0.929 |
| 0.0749999999998516 | 0.931 | 0.928 | 0.924 |
| 0.0799999999998516 | 0.927 | 0.923 | 0.919 |
| 0.0849999999998516 | 0.922 | 0.919 | 0.915 |
| 0.0899999999998516 | 0.918 | 0.914 | 0.91 |
| 0.0949999999998516 | 0.914 | 0.909 | 0.905 |
| 0.0999999999998516 | 0.909 | 0.905 | 0.9 |
| 0.104999999999852 | 0.905 | 0.9 | 0.896 |
| 0.109999999999852 | 0.901 | 0.896 | 0.891 |
| 0.114999999999852 | 0.897 | 0.891 | 0.886 |
| 0.119999999999852 | 0.892 | 0.887 | 0.882 |
| 0.124999999999852 | 0.888 | 0.882 | 0.877 |
| 0.129999999999852 | 0.884 | 0.878 | 0.872 |
| 0.134999999999852 | 0.88 | 0.874 | 0.868 |
| 0.139999999999852 | 0.875 | 0.869 | 0.863 |
| 0.144999999999852 | 0.871 | 0.865 | 0.859 |
| 0.149999999999852 | 0.867 | 0.861 | 0.854 |
| 0.154999999999852 | 0.863 | 0.856 | 0.85 |
| 0.159999999999852 | 0.859 | 0.852 | 0.845 |
| 0.164999999999852 | 0.855 | 0.848 | 0.841 |
| 0.169999999999852 | 0.851 | 0.844 | 0.837 |
| 0.174999999999852 | 0.847 | 0.839 | 0.832 |
| 0.179999999999852 | 0.843 | 0.835 | 0.828 |
| 0.184999999999852 | 0.839 | 0.831 | 0.823 |
| 0.189999999999852 | 0.835 | 0.827 | 0.819 |
| 0.194999999999852 | 0.831 | 0.823 | 0.815 |
| 0.199999999999852 | 0.827 | 0.819 | 0.811 |
| 0.204999999999852 | 0.823 | 0.815 | 0.806 |
| 0.209999999999852 | 0.819 | 0.811 | 0.802 |
| 0.214999999999852 | 0.815 | 0.807 | 0.798 |
| 0.219999999999852 | 0.811 | 0.803 | 0.794 |
| 0.224999999999852 | 0.808 | 0.799 | 0.79 |
| 0.229999999999852 | 0.804 | 0.795 | 0.785 |
| 0.234999999999852 | 0.8 | 0.791 | 0.781 |
| 0.239999999999852 | 0.796 | 0.787 | 0.777 |
| 0.244999999999852 | 0.792 | 0.783 | 0.773 |
| 0.249999999999852 | 0.789 | 0.779 | 0.769 |
| 0.254999999999852 | 0.785 | 0.775 | 0.765 |
| 0.259999999999852 | 0.781 | 0.771 | 0.761 |
| 0.264999999999852 | 0.777 | 0.767 | 0.757 |
| 0.269999999999852 | 0.774 | 0.763 | 0.753 |
| 0.274999999999852 | 0.77 | 0.76 | 0.749 |
| 0.279999999999852 | 0.766 | 0.756 | 0.745 |
| 0.284999999999852 | 0.763 | 0.752 | 0.741 |
| 0.289999999999852 | 0.759 | 0.748 | 0.737 |
| 0.294999999999852 | 0.756 | 0.745 | 0.734 |
| 0.299999999999852 | 0.752 | 0.741 | 0.73 |
| 0.304999999999852 | 0.748 | 0.737 | 0.726 |
| 0.309999999999852 | 0.745 | 0.733 | 0.722 |
| 0.314999999999852 | 0.741 | 0.73 | 0.718 |
| 0.319999999999852 | 0.738 | 0.726 | 0.715 |
| 0.324999999999852 | 0.734 | 0.723 | 0.711 |
| 0.329999999999852 | 0.731 | 0.719 | 0.707 |
| 0.334999999999852 | 0.727 | 0.715 | 0.703 |
| 0.339999999999852 | 0.724 | 0.712 | 0.7 |
| 0.344999999999852 | 0.721 | 0.708 | 0.696 |
| 0.349999999999852 | 0.717 | 0.705 | 0.692 |
| 0.354999999999852 | 0.714 | 0.701 | 0.689 |
| 0.359999999999852 | 0.71 | 0.698 | 0.685 |
| 0.364999999999852 | 0.707 | 0.694 | 0.682 |
| 0.369999999999852 | 0.704 | 0.691 | 0.678 |
| 0.374999999999852 | 0.7 | 0.687 | 0.675 |
| 0.379999999999852 | 0.697 | 0.684 | 0.671 |
| 0.384999999999852 | 0.694 | 0.68 | 0.667 |
| 0.389999999999852 | 0.69 | 0.677 | 0.664 |
| 0.394999999999852 | 0.687 | 0.674 | 0.661 |
| 0.399999999999852 | 0.684 | 0.67 | 0.657 |
| 0.404999999999852 | 0.681 | 0.667 | 0.654 |
| 0.409999999999852 | 0.677 | 0.664 | 0.65 |
| 0.414999999999852 | 0.674 | 0.66 | 0.647 |
| 0.419999999999852 | 0.671 | 0.657 | 0.643 |
| 0.424999999999852 | 0.668 | 0.654 | 0.64 |
| 0.429999999999852 | 0.665 | 0.651 | 0.637 |
| 0.434999999999852 | 0.661 | 0.647 | 0.633 |
| 0.439999999999852 | 0.658 | 0.644 | 0.63 |
| 0.444999999999852 | 0.655 | 0.641 | 0.627 |
| 0.449999999999852 | 0.652 | 0.638 | 0.623 |
| 0.454999999999852 | 0.649 | 0.634 | 0.62 |
| 0.459999999999852 | 0.646 | 0.631 | 0.617 |
| 0.464999999999852 | 0.643 | 0.628 | 0.614 |
| 0.469999999999852 | 0.64 | 0.625 | 0.61 |
| 0.474999999999852 | 0.637 | 0.622 | 0.607 |
| 0.479999999999852 | 0.634 | 0.619 | 0.604 |
| 0.484999999999852 | 0.631 | 0.616 | 0.601 |
| 0.489999999999852 | 0.628 | 0.613 | 0.598 |
| 0.494999999999852 | 0.625 | 0.61 | 0.595 |
| 0.499999999999852 | 0.622 | 0.607 | 0.592 |
| 0.504999999999852 | 0.619 | 0.604 | 0.588 |
| 0.509999999999852 | 0.616 | 0.6 | 0.585 |
| 0.514999999999852 | 0.613 | 0.598 | 0.582 |
| 0.519999999999852 | 0.61 | 0.595 | 0.579 |
| 0.524999999999852 | 0.607 | 0.592 | 0.576 |
| 0.529999999999852 | 0.604 | 0.589 | 0.573 |
| 0.534999999999852 | 0.602 | 0.586 | 0.57 |
| 0.539999999999852 | 0.599 | 0.583 | 0.567 |
| 0.544999999999852 | 0.596 | 0.58 | 0.564 |
| 0.549999999999852 | 0.593 | 0.577 | 0.561 |
| 0.554999999999852 | 0.59 | 0.574 | 0.558 |
| 0.559999999999852 | 0.587 | 0.571 | 0.555 |
| 0.564999999999852 | 0.585 | 0.568 | 0.553 |
| 0.569999999999852 | 0.582 | 0.566 | 0.55 |
| 0.574999999999852 | 0.579 | 0.563 | 0.547 |
| 0.579999999999852 | 0.576 | 0.56 | 0.544 |
| 0.584999999999852 | 0.574 | 0.557 | 0.541 |
| 0.589999999999852 | 0.571 | 0.554 | 0.538 |
| 0.594999999999852 | 0.568 | 0.552 | 0.535 |
| 0.599999999999852 | 0.566 | 0.549 | 0.533 |
| 0.604999999999852 | 0.563 | 0.546 | 0.53 |
| 0.609999999999852 | 0.56 | 0.543 | 0.527 |
| 0.614999999999852 | 0.558 | 0.541 | 0.524 |
| 0.619999999999852 | 0.555 | 0.538 | 0.522 |
| 0.624999999999852 | 0.552 | 0.535 | 0.519 |
| 0.629999999999852 | 0.55 | 0.533 | 0.516 |
| 0.634999999999852 | 0.547 | 0.53 | 0.513 |
| 0.639999999999852 | 0.544 | 0.527 | 0.511 |
| 0.644999999999852 | 0.542 | 0.525 | 0.508 |
| 0.649999999999852 | 0.539 | 0.522 | 0.505 |
| 0.654999999999852 | 0.537 | 0.519 | 0.503 |
| 0.659999999999852 | 0.534 | 0.517 | 0.5 |
| 0.664999999999852 | 0.532 | 0.514 | 0.497 |
| 0.669999999999852 | 0.529 | 0.512 | 0.495 |
| 0.674999999999852 | 0.527 | 0.509 | 0.492 |
| 0.679999999999852 | 0.524 | 0.507 | 0.49 |
| 0.684999999999852 | 0.522 | 0.504 | 0.487 |
| 0.689999999999852 | 0.519 | 0.502 | 0.485 |
| 0.694999999999852 | 0.517 | 0.499 | 0.482 |
| 0.699999999999852 | 0.514 | 0.497 | 0.48 |
| 0.704999999999852 | 0.512 | 0.494 | 0.477 |
| 0.709999999999852 | 0.509 | 0.492 | 0.474 |
| 0.714999999999852 | 0.507 | 0.489 | 0.472 |
| 0.719999999999852 | 0.505 | 0.487 | 0.47 |
| 0.724999999999852 | 0.502 | 0.484 | 0.467 |
| 0.729999999999852 | 0.5 | 0.482 | 0.465 |
| 0.734999999999852 | 0.497 | 0.48 | 0.462 |
| 0.739999999999852 | 0.495 | 0.477 | 0.46 |
| 0.744999999999852 | 0.493 | 0.475 | 0.457 |
| 0.749999999999852 | 0.49 | 0.472 | 0.455 |
| 0.754999999999852 | 0.488 | 0.47 | 0.453 |
| 0.759999999999852 | 0.486 | 0.468 | 0.45 |
| 0.764999999999852 | 0.483 | 0.465 | 0.448 |
| 0.769999999999852 | 0.481 | 0.463 | 0.446 |
| 0.774999999999852 | 0.479 | 0.461 | 0.443 |
| 0.779999999999852 | 0.477 | 0.458 | 0.441 |
| 0.784999999999852 | 0.474 | 0.456 | 0.439 |
| 0.789999999999852 | 0.472 | 0.454 | 0.436 |
| 0.794999999999852 | 0.47 | 0.452 | 0.434 |
| 0.799999999999852 | 0.468 | 0.449 | 0.432 |
| 0.804999999999852 | 0.465 | 0.447 | 0.429 |
| 0.809999999999852 | 0.463 | 0.445 | 0.427 |
| 0.814999999999852 | 0.461 | 0.443 | 0.425 |
| 0.819999999999852 | 0.459 | 0.44 | 0.423 |
| 0.824999999999852 | 0.457 | 0.438 | 0.421 |
| 0.829999999999852 | 0.455 | 0.436 | 0.418 |
| 0.834999999999852 | 0.452 | 0.434 | 0.416 |
| 0.839999999999852 | 0.45 | 0.432 | 0.414 |
| 0.844999999999852 | 0.448 | 0.43 | 0.412 |
| 0.849999999999852 | 0.446 | 0.427 | 0.41 |
| 0.854999999999852 | 0.444 | 0.425 | 0.407 |
| 0.859999999999852 | 0.442 | 0.423 | 0.405 |
| 0.864999999999852 | 0.44 | 0.421 | 0.403 |
| 0.869999999999852 | 0.438 | 0.419 | 0.401 |
| 0.874999999999852 | 0.436 | 0.417 | 0.399 |
| 0.879999999999852 | 0.433 | 0.415 | 0.397 |
| 0.884999999999852 | 0.431 | 0.413 | 0.395 |
| 0.889999999999852 | 0.429 | 0.411 | 0.393 |
| 0.894999999999852 | 0.427 | 0.409 | 0.391 |
| 0.899999999999852 | 0.425 | 0.407 | 0.389 |
| 0.904999999999852 | 0.423 | 0.405 | 0.387 |
| 0.909999999999852 | 0.421 | 0.403 | 0.385 |
| 0.914999999999852 | 0.419 | 0.401 | 0.383 |
| 0.919999999999852 | 0.417 | 0.399 | 0.381 |
| 0.924999999999852 | 0.415 | 0.397 | 0.379 |
| 0.929999999999852 | 0.413 | 0.395 | 0.377 |
| 0.934999999999852 | 0.411 | 0.393 | 0.375 |
| 0.939999999999852 | 0.409 | 0.391 | 0.373 |
| 0.944999999999852 | 0.407 | 0.389 | 0.371 |
| 0.949999999999852 | 0.406 | 0.387 | 0.369 |
| 0.954999999999852 | 0.404 | 0.385 | 0.367 |
| 0.959999999999852 | 0.402 | 0.383 | 0.365 |
| 0.964999999999852 | 0.4 | 0.381 | 0.363 |
| 0.969999999999852 | 0.398 | 0.379 | 0.361 |
| 0.974999999999852 | 0.396 | 0.377 | 0.359 |
| 0.979999999999852 | 0.394 | 0.375 | 0.357 |
| 0.984999999999852 | 0.392 | 0.373 | 0.355 |
| 0.989999999999852 | 0.39 | 0.372 | 0.354 |
| 0.994999999999852 | 0.389 | 0.37 | 0.352 |
| 0.999999999999852 | 0.387 | 0.368 | 0.35 |
| 1.004999999999852 | 0.385 | 0.366 | 0.348 |
| 1.009999999999852 | 0.383 | 0.364 | 0.346 |
| 1.014999999999852 | 0.381 | 0.362 | 0.344 |
| 1.019999999999852 | 0.379 | 0.361 | 0.343 |
| 1.024999999999852 | 0.378 | 0.359 | 0.341 |
| 1.029999999999852 | 0.376 | 0.357 | 0.339 |
| 1.034999999999852 | 0.374 | 0.355 | 0.337 |
| 1.039999999999851 | 0.372 | 0.353 | 0.336 |
| 1.044999999999851 | 0.371 | 0.352 | 0.334 |
| 1.049999999999851 | 0.369 | 0.35 | 0.332 |
| 1.054999999999851 | 0.367 | 0.348 | 0.33 |
| 1.059999999999851 | 0.365 | 0.346 | 0.329 |
| 1.064999999999851 | 0.364 | 0.345 | 0.327 |
| 1.069999999999851 | 0.362 | 0.343 | 0.325 |
| 1.074999999999851 | 0.36 | 0.341 | 0.323 |
| 1.079999999999851 | 0.358 | 0.34 | 0.322 |
| 1.084999999999851 | 0.357 | 0.338 | 0.32 |
| 1.08999999999985 | 0.355 | 0.336 | 0.318 |
| 1.09499999999985 | 0.353 | 0.335 | 0.317 |
| 1.09999999999985 | 0.352 | 0.333 | 0.315 |
| 1.10499999999985 | 0.35 | 0.331 | 0.313 |
| 1.10999999999985 | 0.348 | 0.33 | 0.312 |
| 1.11499999999985 | 0.347 | 0.328 | 0.31 |
| 1.11999999999985 | 0.345 | 0.326 | 0.309 |
| 1.12499999999985 | 0.343 | 0.325 | 0.307 |
| 1.12999999999985 | 0.342 | 0.323 | 0.305 |
| 1.134999999999849 | 0.34 | 0.321 | 0.304 |
| 1.139999999999849 | 0.339 | 0.32 | 0.302 |
| 1.144999999999849 | 0.337 | 0.318 | 0.301 |
| 1.149999999999849 | 0.335 | 0.317 | 0.299 |
| 1.15499999999985 | 0.334 | 0.315 | 0.297 |
| 1.159999999999849 | 0.332 | 0.313 | 0.296 |
| 1.164999999999849 | 0.331 | 0.312 | 0.294 |
| 1.169999999999849 | 0.329 | 0.31 | 0.293 |
| 1.174999999999849 | 0.328 | 0.309 | 0.291 |
| 1.179999999999848 | 0.326 | 0.307 | 0.29 |
| 1.184999999999848 | 0.324 | 0.306 | 0.288 |
| 1.189999999999848 | 0.323 | 0.304 | 0.287 |
| 1.194999999999848 | 0.321 | 0.303 | 0.285 |
| 1.199999999999848 | 0.32 | 0.301 | 0.284 |
| 1.204999999999848 | 0.318 | 0.3 | 0.282 |
| 1.209999999999848 | 0.317 | 0.298 | 0.281 |
| 1.214999999999848 | 0.315 | 0.297 | 0.279 |
| 1.219999999999848 | 0.314 | 0.295 | 0.278 |
| 1.224999999999848 | 0.312 | 0.294 | 0.276 |
| 1.229999999999847 | 0.311 | 0.292 | 0.275 |
| 1.234999999999847 | 0.309 | 0.291 | 0.273 |
| 1.239999999999847 | 0.308 | 0.289 | 0.272 |
| 1.244999999999847 | 0.306 | 0.288 | 0.271 |
| 1.249999999999847 | 0.305 | 0.287 | 0.269 |
| 1.254999999999847 | 0.304 | 0.285 | 0.268 |
| 1.259999999999847 | 0.302 | 0.284 | 0.266 |
| 1.264999999999847 | 0.301 | 0.282 | 0.265 |
| 1.269999999999847 | 0.299 | 0.281 | 0.264 |
| 1.274999999999846 | 0.298 | 0.279 | 0.262 |
| 1.279999999999846 | 0.296 | 0.278 | 0.261 |
| 1.284999999999846 | 0.295 | 0.277 | 0.259 |
| 1.289999999999846 | 0.294 | 0.275 | 0.258 |
| 1.294999999999846 | 0.292 | 0.274 | 0.257 |
| 1.299999999999846 | 0.291 | 0.273 | 0.255 |
| 1.304999999999846 | 0.289 | 0.271 | 0.254 |
| 1.309999999999846 | 0.288 | 0.27 | 0.253 |
| 1.314999999999846 | 0.287 | 0.268 | 0.251 |
| 1.319999999999845 | 0.285 | 0.267 | 0.25 |
| 1.324999999999845 | 0.284 | 0.266 | 0.249 |
| 1.329999999999845 | 0.283 | 0.264 | 0.247 |
| 1.334999999999845 | 0.281 | 0.263 | 0.246 |
| 1.339999999999845 | 0.28 | 0.262 | 0.245 |
| 1.344999999999845 | 0.279 | 0.261 | 0.244 |
| 1.349999999999845 | 0.277 | 0.259 | 0.242 |
| 1.354999999999845 | 0.276 | 0.258 | 0.241 |
| 1.359999999999845 | 0.275 | 0.257 | 0.24 |
| 1.364999999999845 | 0.273 | 0.255 | 0.239 |
| 1.369999999999844 | 0.272 | 0.254 | 0.237 |
| 1.374999999999844 | 0.271 | 0.253 | 0.236 |
| 1.379999999999844 | 0.27 | 0.252 | 0.235 |
| 1.384999999999844 | 0.268 | 0.25 | 0.234 |
| 1.389999999999844 | 0.267 | 0.249 | 0.232 |
| 1.394999999999844 | 0.266 | 0.248 | 0.231 |
| 1.399999999999844 | 0.264 | 0.247 | 0.23 |
| 1.404999999999844 | 0.263 | 0.245 | 0.229 |
| 1.409999999999844 | 0.262 | 0.244 | 0.228 |
| 1.414999999999843 | 0.261 | 0.243 | 0.226 |
| 1.419999999999843 | 0.259 | 0.242 | 0.225 |
| 1.424999999999843 | 0.258 | 0.241 | 0.224 |
| 1.429999999999843 | 0.257 | 0.239 | 0.223 |
| 1.434999999999843 | 0.256 | 0.238 | 0.222 |
| 1.439999999999843 | 0.255 | 0.237 | 0.22 |
| 1.444999999999843 | 0.253 | 0.236 | 0.219 |
| 1.449999999999843 | 0.252 | 0.235 | 0.218 |
| 1.454999999999843 | 0.251 | 0.233 | 0.217 |
| 1.459999999999842 | 0.25 | 0.232 | 0.216 |
| 1.464999999999842 | 0.249 | 0.231 | 0.215 |
| 1.469999999999842 | 0.247 | 0.23 | 0.214 |
| 1.474999999999842 | 0.246 | 0.229 | 0.213 |
| 1.479999999999842 | 0.245 | 0.228 | 0.211 |
| 1.484999999999842 | 0.244 | 0.227 | 0.21 |
| 1.489999999999842 | 0.243 | 0.225 | 0.209 |
| 1.494999999999842 | 0.242 | 0.224 | 0.208 |
| 1.499999999999842 | 0.241 | 0.223 | 0.207 |
| 1.504999999999842 | 0.239 | 0.222 | 0.206 |
| 1.509999999999841 | 0.238 | 0.221 | 0.205 |
| 1.514999999999841 | 0.237 | 0.22 | 0.204 |
| 1.519999999999841 | 0.236 | 0.219 | 0.203 |
| 1.524999999999841 | 0.235 | 0.218 | 0.202 |
| 1.529999999999841 | 0.234 | 0.217 | 0.201 |
| 1.534999999999841 | 0.233 | 0.215 | 0.2 |
| 1.539999999999841 | 0.232 | 0.214 | 0.198 |
| 1.544999999999841 | 0.23 | 0.213 | 0.197 |
| 1.549999999999841 | 0.229 | 0.212 | 0.196 |
| 1.55499999999984 | 0.228 | 0.211 | 0.195 |
| 1.55999999999984 | 0.227 | 0.21 | 0.194 |
| 1.56499999999984 | 0.226 | 0.209 | 0.193 |
| 1.56999999999984 | 0.225 | 0.208 | 0.192 |
| 1.57499999999984 | 0.224 | 0.207 | 0.191 |
| 1.57999999999984 | 0.223 | 0.206 | 0.19 |
| 1.58499999999984 | 0.222 | 0.205 | 0.189 |
| 1.58999999999984 | 0.221 | 0.204 | 0.188 |
| 1.59499999999984 | 0.22 | 0.203 | 0.187 |
| 1.59999999999984 | 0.219 | 0.202 | 0.186 |
| 1.604999999999839 | 0.218 | 0.201 | 0.185 |
| 1.609999999999839 | 0.217 | 0.2 | 0.184 |
| 1.614999999999839 | 0.216 | 0.199 | 0.183 |
| 1.619999999999839 | 0.215 | 0.198 | 0.183 |
| 1.624999999999839 | 0.214 | 0.197 | 0.182 |
| 1.629999999999839 | 0.213 | 0.196 | 0.181 |
| 1.634999999999839 | 0.212 | 0.195 | 0.18 |
| 1.639999999999839 | 0.211 | 0.194 | 0.179 |
| 1.644999999999838 | 0.21 | 0.193 | 0.178 |
| 1.649999999999838 | 0.209 | 0.192 | 0.177 |
| 1.654999999999838 | 0.208 | 0.191 | 0.176 |
| 1.659999999999838 | 0.207 | 0.19 | 0.175 |
| 1.664999999999838 | 0.206 | 0.189 | 0.174 |
| 1.669999999999838 | 0.205 | 0.188 | 0.173 |
| 1.674999999999838 | 0.204 | 0.187 | 0.172 |
| 1.679999999999838 | 0.203 | 0.186 | 0.171 |
| 1.684999999999838 | 0.202 | 0.185 | 0.17 |
| 1.689999999999838 | 0.201 | 0.185 | 0.17 |
| 1.694999999999837 | 0.2 | 0.184 | 0.169 |
| 1.699999999999837 | 0.199 | 0.183 | 0.168 |
| 1.704999999999837 | 0.198 | 0.182 | 0.167 |
| 1.709999999999837 | 0.197 | 0.181 | 0.166 |
| 1.714999999999837 | 0.196 | 0.18 | 0.165 |
| 1.719999999999837 | 0.195 | 0.179 | 0.164 |
| 1.724999999999837 | 0.194 | 0.178 | 0.163 |
| 1.729999999999837 | 0.193 | 0.177 | 0.163 |
| 1.734999999999837 | 0.192 | 0.176 | 0.162 |
| 1.739999999999836 | 0.191 | 0.176 | 0.161 |
| 1.744999999999836 | 0.191 | 0.175 | 0.16 |
| 1.749999999999836 | 0.19 | 0.174 | 0.159 |
| 1.754999999999836 | 0.189 | 0.173 | 0.158 |
| 1.759999999999836 | 0.188 | 0.172 | 0.158 |
| 1.764999999999836 | 0.187 | 0.171 | 0.157 |
| 1.769999999999836 | 0.186 | 0.17 | 0.156 |
| 1.774999999999836 | 0.185 | 0.169 | 0.155 |
| 1.779999999999836 | 0.184 | 0.169 | 0.154 |
| 1.784999999999836 | 0.183 | 0.168 | 0.153 |
| 1.789999999999835 | 0.183 | 0.167 | 0.153 |
| 1.794999999999835 | 0.182 | 0.166 | 0.152 |
| 1.799999999999835 | 0.181 | 0.165 | 0.151 |
| 1.804999999999835 | 0.18 | 0.164 | 0.15 |
| 1.809999999999835 | 0.179 | 0.164 | 0.149 |
| 1.814999999999835 | 0.178 | 0.163 | 0.149 |
| 1.819999999999835 | 0.177 | 0.162 | 0.148 |
| 1.824999999999835 | 0.177 | 0.161 | 0.147 |
| 1.829999999999835 | 0.176 | 0.16 | 0.146 |
| 1.834999999999834 | 0.175 | 0.16 | 0.146 |
| 1.839999999999834 | 0.174 | 0.159 | 0.145 |
| 1.844999999999834 | 0.173 | 0.158 | 0.144 |
| 1.849999999999834 | 0.172 | 0.157 | 0.143 |
| 1.854999999999834 | 0.172 | 0.156 | 0.143 |
| 1.859999999999834 | 0.171 | 0.156 | 0.142 |
| 1.864999999999834 | 0.17 | 0.155 | 0.141 |
| 1.869999999999834 | 0.169 | 0.154 | 0.14 |
| 1.874999999999834 | 0.168 | 0.153 | 0.14 |
| 1.879999999999834 | 0.168 | 0.153 | 0.139 |
| 1.884999999999833 | 0.167 | 0.152 | 0.138 |
| 1.889999999999833 | 0.166 | 0.151 | 0.137 |
| 1.894999999999833 | 0.165 | 0.15 | 0.137 |
| 1.899999999999833 | 0.164 | 0.15 | 0.136 |
| 1.904999999999833 | 0.164 | 0.149 | 0.135 |
| 1.909999999999833 | 0.163 | 0.148 | 0.135 |
| 1.914999999999833 | 0.162 | 0.147 | 0.134 |
| 1.919999999999833 | 0.161 | 0.147 | 0.133 |
| 1.924999999999833 | 0.161 | 0.146 | 0.132 |
| 1.929999999999832 | 0.16 | 0.145 | 0.132 |
| 1.934999999999832 | 0.159 | 0.144 | 0.131 |
| 1.939999999999832 | 0.158 | 0.144 | 0.13 |
| 1.944999999999832 | 0.158 | 0.143 | 0.13 |
| 1.949999999999832 | 0.157 | 0.142 | 0.129 |
| 1.954999999999832 | 0.156 | 0.142 | 0.128 |
| 1.959999999999832 | 0.155 | 0.141 | 0.128 |
| 1.964999999999832 | 0.155 | 0.14 | 0.127 |
| 1.969999999999832 | 0.154 | 0.139 | 0.126 |
| 1.974999999999832 | 0.153 | 0.139 | 0.126 |
| 1.979999999999831 | 0.152 | 0.138 | 0.125 |
| 1.984999999999831 | 0.152 | 0.137 | 0.124 |
| 1.989999999999831 | 0.151 | 0.137 | 0.124 |
| 1.994999999999831 | 0.15 | 0.136 | 0.123 |
| 1.999999999999831 | 0.15 | 0.135 | 0.122 |